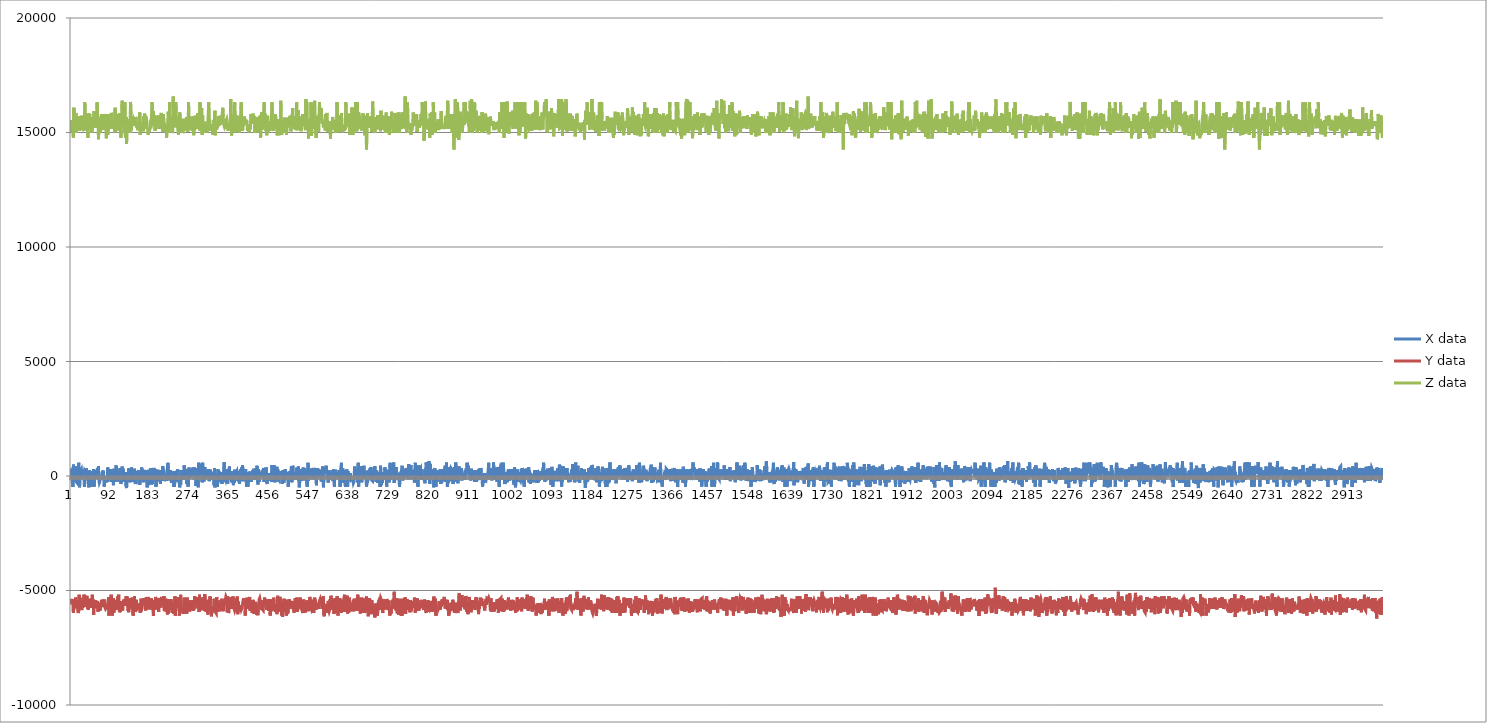
| Category | X data | Y data | Z data |
|---|---|---|---|
| 0 | 336 | -5360 | 15024 |
| 1 | 0 | -5600 | 15536 |
| 2 | -176 | -5392 | 15216 |
| 3 | -304 | -5552 | 15136 |
| 4 | -480 | -5392 | 15472 |
| 5 | 496 | -5968 | 14768 |
| 6 | 256 | -5744 | 16080 |
| 7 | -256 | -5680 | 15680 |
| 8 | -48 | -5648 | 15024 |
| 9 | -208 | -5776 | 15552 |
| 10 | 416 | -5312 | 15552 |
| 11 | 256 | -5360 | 15856 |
| 12 | -272 | -5360 | 14992 |
| 13 | -256 | -5632 | 15696 |
| 14 | -320 | -5568 | 15216 |
| 15 | -256 | -5600 | 15280 |
| 16 | -272 | -5984 | 15136 |
| 17 | 576 | -5904 | 15584 |
| 18 | -352 | -5184 | 15696 |
| 19 | -496 | -5488 | 15088 |
| 20 | -16 | -5312 | 15200 |
| 21 | 256 | -5808 | 15488 |
| 22 | 240 | -5488 | 15104 |
| 23 | 320 | -5504 | 15728 |
| 24 | 320 | -5856 | 15424 |
| 25 | -96 | -5488 | 15344 |
| 26 | 48 | -5760 | 15360 |
| 27 | 144 | -5392 | 15216 |
| 28 | 304 | -5648 | 15296 |
| 29 | -48 | -5184 | 15088 |
| 30 | -480 | -5312 | 15472 |
| 31 | 256 | -5360 | 16320 |
| 32 | 288 | -5600 | 15568 |
| 33 | 208 | -5712 | 15104 |
| 34 | 336 | -5648 | 15264 |
| 35 | 256 | -5280 | 15216 |
| 36 | 192 | -5232 | 15792 |
| 37 | -176 | -5808 | 15248 |
| 38 | -96 | -5584 | 14768 |
| 39 | -336 | -5840 | 15536 |
| 40 | -496 | -5696 | 15840 |
| 41 | 240 | -5440 | 15216 |
| 42 | 192 | -5360 | 15808 |
| 43 | -176 | -5392 | 15344 |
| 44 | 208 | -5648 | 15408 |
| 45 | -480 | -5456 | 15680 |
| 46 | 208 | -5760 | 15104 |
| 47 | -144 | -5360 | 14992 |
| 48 | -480 | -5184 | 15184 |
| 49 | -64 | -5440 | 15312 |
| 50 | -96 | -5392 | 15440 |
| 51 | 304 | -6064 | 15424 |
| 52 | -464 | -5472 | 15936 |
| 53 | -144 | -5584 | 15488 |
| 54 | 160 | -5728 | 15440 |
| 55 | 16 | -5776 | 15488 |
| 56 | -64 | -5440 | 15216 |
| 57 | 256 | -5440 | 15872 |
| 58 | 112 | -5712 | 15392 |
| 59 | 256 | -5664 | 16320 |
| 60 | 352 | -5472 | 15808 |
| 61 | -128 | -5920 | 15680 |
| 62 | 432 | -5712 | 14704 |
| 63 | -176 | -5696 | 15216 |
| 64 | -304 | -5552 | 15424 |
| 65 | -256 | -5712 | 15392 |
| 66 | -96 | -5872 | 14976 |
| 67 | -112 | -5728 | 15680 |
| 68 | 16 | -5520 | 15264 |
| 69 | -176 | -5408 | 15808 |
| 70 | -160 | -5632 | 15504 |
| 71 | 160 | -5408 | 15744 |
| 72 | 160 | -5584 | 15552 |
| 73 | 240 | -5648 | 15104 |
| 74 | -48 | -5712 | 15808 |
| 75 | -464 | -5440 | 15840 |
| 76 | -304 | -5392 | 15408 |
| 77 | -144 | -5760 | 15504 |
| 78 | -256 | -5808 | 15504 |
| 79 | -48 | -5792 | 15808 |
| 80 | -272 | -5824 | 14752 |
| 81 | -144 | -5712 | 15152 |
| 82 | -256 | -5728 | 15792 |
| 83 | 368 | -5584 | 14896 |
| 84 | 368 | -5808 | 15552 |
| 85 | -176 | -5296 | 15088 |
| 86 | -64 | -6096 | 15744 |
| 87 | 304 | -5824 | 15168 |
| 88 | -128 | -5488 | 15472 |
| 89 | 256 | -5712 | 15808 |
| 90 | 272 | -5280 | 15200 |
| 91 | -256 | -5184 | 15856 |
| 92 | 288 | -5376 | 15808 |
| 93 | -96 | -5888 | 15488 |
| 94 | 96 | -6096 | 15488 |
| 95 | -64 | -5616 | 15152 |
| 96 | -400 | -5344 | 15552 |
| 97 | 256 | -5968 | 15152 |
| 98 | 320 | -5456 | 15216 |
| 99 | -176 | -5808 | 15008 |
| 100 | -256 | -5424 | 16080 |
| 101 | -80 | -5568 | 15024 |
| 102 | 464 | -5840 | 15600 |
| 103 | 272 | -5440 | 15808 |
| 104 | 304 | -5792 | 15248 |
| 105 | -16 | -5392 | 15360 |
| 106 | -240 | -5248 | 15152 |
| 107 | -256 | -5360 | 15440 |
| 108 | -48 | -5184 | 15088 |
| 109 | 160 | -5840 | 15488 |
| 110 | -64 | -5952 | 15840 |
| 111 | 336 | -5888 | 15488 |
| 112 | 128 | -5936 | 15520 |
| 113 | -352 | -5472 | 14768 |
| 114 | -352 | -5872 | 15808 |
| 115 | 256 | -5552 | 15376 |
| 116 | 416 | -5824 | 16384 |
| 117 | 112 | -5872 | 15488 |
| 118 | 320 | -5504 | 15440 |
| 119 | -240 | -5440 | 15280 |
| 120 | 176 | -5472 | 15808 |
| 121 | -160 | -5424 | 14992 |
| 122 | 48 | -5424 | 16320 |
| 123 | -144 | -5664 | 14896 |
| 124 | 176 | -5536 | 14768 |
| 125 | -464 | -5248 | 15680 |
| 126 | -528 | -5536 | 14512 |
| 127 | 160 | -5264 | 15472 |
| 128 | -144 | -5600 | 15232 |
| 129 | -16 | -5888 | 15584 |
| 130 | -48 | -5840 | 15216 |
| 131 | 336 | -5952 | 15040 |
| 132 | 320 | -5536 | 15136 |
| 133 | -272 | -5712 | 15136 |
| 134 | -288 | -5568 | 14992 |
| 135 | -32 | -5328 | 16336 |
| 136 | -208 | -5776 | 15808 |
| 137 | 368 | -5584 | 15088 |
| 138 | 256 | -5408 | 15472 |
| 139 | -256 | -5312 | 15696 |
| 140 | 0 | -5312 | 15728 |
| 141 | 32 | -6096 | 15488 |
| 142 | -112 | -5344 | 15600 |
| 143 | -16 | -5424 | 15552 |
| 144 | 320 | -5248 | 15280 |
| 145 | -96 | -5920 | 15520 |
| 146 | -48 | -5904 | 15392 |
| 147 | -352 | -5824 | 15680 |
| 148 | -224 | -5408 | 15600 |
| 149 | -96 | -5648 | 15216 |
| 150 | 208 | -5808 | 15488 |
| 151 | -176 | -5840 | 15104 |
| 152 | 208 | -5760 | 15104 |
| 153 | 256 | -5760 | 15280 |
| 154 | -160 | -5616 | 15280 |
| 155 | 0 | -5776 | 15184 |
| 156 | -384 | -5568 | 15872 |
| 157 | -16 | -5968 | 14896 |
| 158 | 48 | -5696 | 15136 |
| 159 | -160 | -5360 | 15152 |
| 160 | 368 | -5904 | 15360 |
| 161 | 336 | -5472 | 15232 |
| 162 | 352 | -5584 | 15296 |
| 163 | 192 | -5520 | 15472 |
| 164 | -272 | -5360 | 15056 |
| 165 | 256 | -5584 | 15712 |
| 166 | 208 | -5328 | 15152 |
| 167 | 256 | -5344 | 15824 |
| 168 | 48 | -5696 | 15712 |
| 169 | 176 | -5872 | 15376 |
| 170 | 256 | -5584 | 15568 |
| 171 | -224 | -5296 | 15696 |
| 172 | 192 | -5840 | 15248 |
| 173 | -496 | -5488 | 15216 |
| 174 | 208 | -5808 | 15136 |
| 175 | -400 | -5280 | 14896 |
| 176 | -240 | -5440 | 15152 |
| 177 | 272 | -5584 | 15152 |
| 178 | -304 | -5728 | 15024 |
| 179 | -144 | -5376 | 15216 |
| 180 | -256 | -5824 | 15520 |
| 181 | 336 | -5728 | 15184 |
| 182 | 48 | -5344 | 15152 |
| 183 | -368 | -5440 | 15808 |
| 184 | 288 | -5744 | 16320 |
| 185 | -336 | -5776 | 15360 |
| 186 | 192 | -5840 | 15488 |
| 187 | 192 | -6112 | 15936 |
| 188 | 352 | -5648 | 15296 |
| 189 | 256 | -5584 | 15680 |
| 190 | -128 | -5408 | 15760 |
| 191 | -144 | -5824 | 15072 |
| 192 | 288 | -5280 | 15344 |
| 193 | -464 | -5440 | 15152 |
| 194 | -64 | -5712 | 15600 |
| 195 | -96 | -5808 | 15680 |
| 196 | 160 | -5328 | 15440 |
| 197 | 208 | -5440 | 15552 |
| 198 | 272 | -5808 | 15744 |
| 199 | 0 | -5936 | 15488 |
| 200 | 80 | -5328 | 15152 |
| 201 | -224 | -5424 | 15440 |
| 202 | 192 | -5760 | 15488 |
| 203 | -336 | -5472 | 15328 |
| 204 | 112 | -5520 | 15312 |
| 205 | -64 | -5600 | 15856 |
| 206 | 256 | -5280 | 15216 |
| 207 | -192 | -5600 | 15376 |
| 208 | 432 | -5616 | 15088 |
| 209 | 368 | -5440 | 15024 |
| 210 | 256 | -5728 | 15792 |
| 211 | -112 | -5248 | 15264 |
| 212 | -224 | -5872 | 15424 |
| 213 | -144 | -5744 | 15024 |
| 214 | -64 | -5904 | 15360 |
| 215 | -112 | -5360 | 15088 |
| 216 | 32 | -5888 | 15360 |
| 217 | -208 | -5424 | 14768 |
| 218 | 208 | -5904 | 15136 |
| 219 | 176 | -6048 | 15360 |
| 220 | 576 | -5760 | 15296 |
| 221 | 336 | -6000 | 15904 |
| 222 | -32 | -5376 | 14992 |
| 223 | -192 | -5360 | 15216 |
| 224 | -128 | -5840 | 16320 |
| 225 | 64 | -5632 | 15280 |
| 226 | 256 | -5632 | 15680 |
| 227 | 128 | -5376 | 15568 |
| 228 | -304 | -5568 | 15360 |
| 229 | -304 | -5920 | 15136 |
| 230 | -16 | -5968 | 14976 |
| 231 | -144 | -5936 | 15072 |
| 232 | -80 | -5520 | 16576 |
| 233 | -464 | -6000 | 15328 |
| 234 | 208 | -6000 | 15744 |
| 235 | -480 | -5584 | 15440 |
| 236 | 0 | -5248 | 15696 |
| 237 | 80 | -6096 | 15232 |
| 238 | 224 | -6096 | 16320 |
| 239 | -144 | -5392 | 15296 |
| 240 | 48 | -5600 | 15312 |
| 241 | -256 | -5296 | 15568 |
| 242 | 288 | -5312 | 15696 |
| 243 | 208 | -5760 | 15104 |
| 244 | -176 | -5584 | 14896 |
| 245 | -208 | -5664 | 15296 |
| 246 | -352 | -6096 | 15008 |
| 247 | -496 | -5856 | 15872 |
| 248 | -160 | -5728 | 15520 |
| 249 | -384 | -5184 | 15536 |
| 250 | 256 | -5600 | 15440 |
| 251 | 256 | -5584 | 15600 |
| 252 | -160 | -5904 | 15392 |
| 253 | 240 | -5952 | 15136 |
| 254 | -96 | -5792 | 14976 |
| 255 | -176 | -6016 | 15024 |
| 256 | 160 | -5760 | 15440 |
| 257 | 464 | -5312 | 15088 |
| 258 | 240 | -5456 | 15600 |
| 259 | 192 | -5440 | 15216 |
| 260 | 304 | -5536 | 15296 |
| 261 | 224 | -5392 | 15360 |
| 262 | 208 | -5776 | 15392 |
| 263 | -352 | -6016 | 15680 |
| 264 | 208 | -5312 | 15232 |
| 265 | 272 | -5792 | 15024 |
| 266 | -464 | -5808 | 15248 |
| 267 | -304 | -5440 | 16320 |
| 268 | 368 | -5792 | 15440 |
| 269 | -80 | -5920 | 15360 |
| 270 | 304 | -5712 | 15488 |
| 271 | -64 | -5504 | 15280 |
| 272 | 208 | -5760 | 15104 |
| 273 | 288 | -5792 | 15360 |
| 274 | 128 | -5424 | 15696 |
| 275 | 208 | -5648 | 15088 |
| 276 | 208 | -5824 | 15136 |
| 277 | 368 | -5888 | 15328 |
| 278 | -16 | -5488 | 15104 |
| 279 | 240 | -5840 | 14880 |
| 280 | 384 | -5712 | 15696 |
| 281 | -48 | -5248 | 15120 |
| 282 | -96 | -5664 | 15728 |
| 283 | 336 | -5584 | 15216 |
| 284 | -432 | -5648 | 15152 |
| 285 | -96 | -5504 | 15632 |
| 286 | 256 | -5648 | 15488 |
| 287 | -80 | -5312 | 15152 |
| 288 | -336 | -5776 | 15840 |
| 289 | -496 | -5312 | 15280 |
| 290 | 576 | -5808 | 15520 |
| 291 | -144 | -5936 | 15552 |
| 292 | 176 | -5184 | 15088 |
| 293 | -128 | -5872 | 16320 |
| 294 | -160 | -5600 | 15392 |
| 295 | 528 | -5440 | 15696 |
| 296 | -160 | -5648 | 15680 |
| 297 | 256 | -5312 | 16064 |
| 298 | -272 | -5376 | 14896 |
| 299 | 576 | -5856 | 15760 |
| 300 | 336 | -5360 | 15328 |
| 301 | -48 | -5392 | 15280 |
| 302 | -240 | -5776 | 15248 |
| 303 | 0 | -5888 | 15392 |
| 304 | 384 | -5152 | 15472 |
| 305 | 288 | -5728 | 15472 |
| 306 | 112 | -5920 | 14992 |
| 307 | -112 | -5696 | 15344 |
| 308 | 256 | -5584 | 15152 |
| 309 | -32 | -5456 | 15024 |
| 310 | 208 | -5904 | 15104 |
| 311 | 208 | -6048 | 15136 |
| 312 | 16 | -5424 | 15088 |
| 313 | 288 | -5760 | 16320 |
| 314 | -224 | -5376 | 15440 |
| 315 | 160 | -5840 | 15552 |
| 316 | -96 | -5264 | 15072 |
| 317 | 272 | -5824 | 15344 |
| 318 | 32 | -5792 | 15280 |
| 319 | 128 | -6128 | 15360 |
| 320 | -144 | -5920 | 15232 |
| 321 | -144 | -5696 | 15328 |
| 322 | 0 | -5792 | 14896 |
| 323 | 176 | -5952 | 15328 |
| 324 | 112 | -5712 | 15088 |
| 325 | -400 | -5360 | 15552 |
| 326 | 336 | -5504 | 14928 |
| 327 | -496 | -5456 | 15952 |
| 328 | -160 | -5936 | 14880 |
| 329 | -48 | -5968 | 15360 |
| 330 | -176 | -6000 | 15120 |
| 331 | -304 | -5280 | 15152 |
| 332 | 112 | -5936 | 15328 |
| 333 | -464 | -5568 | 15184 |
| 334 | 288 | -5440 | 15504 |
| 335 | 256 | -5696 | 15712 |
| 336 | -144 | -5504 | 15296 |
| 337 | 192 | -5872 | 15504 |
| 338 | -256 | -5664 | 15728 |
| 339 | -160 | -5904 | 15328 |
| 340 | -176 | -5696 | 15616 |
| 341 | 0 | -5408 | 15680 |
| 342 | 160 | -5728 | 15520 |
| 343 | -352 | -5360 | 15696 |
| 344 | 160 | -5664 | 15728 |
| 345 | -224 | -5728 | 16080 |
| 346 | -64 | -5904 | 15680 |
| 347 | 240 | -5584 | 15328 |
| 348 | 608 | -5520 | 15360 |
| 349 | -240 | -5376 | 15216 |
| 350 | -144 | -5648 | 15264 |
| 351 | -192 | -5376 | 15440 |
| 352 | -64 | -5264 | 15152 |
| 353 | -176 | -5312 | 15552 |
| 354 | 288 | -5296 | 15600 |
| 355 | -16 | -5952 | 15488 |
| 356 | -336 | -5264 | 15344 |
| 357 | -80 | -5664 | 15072 |
| 358 | 112 | -5984 | 15328 |
| 359 | -80 | -5920 | 15296 |
| 360 | 416 | -5312 | 15344 |
| 361 | -176 | -5632 | 15328 |
| 362 | 112 | -5392 | 15088 |
| 363 | -128 | -5808 | 16448 |
| 364 | 208 | -5312 | 15712 |
| 365 | -272 | -5568 | 14864 |
| 366 | -32 | -5296 | 15808 |
| 367 | -80 | -5792 | 15328 |
| 368 | -48 | -5264 | 15248 |
| 369 | -400 | -5680 | 15104 |
| 370 | 0 | -5504 | 15680 |
| 371 | -288 | -5824 | 15008 |
| 372 | 272 | -5888 | 16320 |
| 373 | -96 | -5824 | 15456 |
| 374 | -144 | -5696 | 15168 |
| 375 | 128 | -5328 | 15152 |
| 376 | 128 | -5888 | 15360 |
| 377 | 208 | -5728 | 15744 |
| 378 | 208 | -5264 | 15184 |
| 379 | -224 | -6032 | 15024 |
| 380 | 208 | -5488 | 15696 |
| 381 | -176 | -5936 | 15360 |
| 382 | -176 | -5776 | 14976 |
| 383 | -336 | -5792 | 15552 |
| 384 | -80 | -5728 | 15440 |
| 385 | 288 | -5648 | 15216 |
| 386 | -16 | -5744 | 15184 |
| 387 | -96 | -5840 | 16320 |
| 388 | 384 | -5792 | 15072 |
| 389 | 256 | -5648 | 15392 |
| 390 | 464 | -5584 | 15088 |
| 391 | -224 | -5632 | 15424 |
| 392 | 272 | -5328 | 15280 |
| 393 | -112 | -5616 | 15296 |
| 394 | -224 | -5440 | 15696 |
| 395 | 256 | -5600 | 15680 |
| 396 | 176 | -6096 | 15488 |
| 397 | 288 | -5552 | 15520 |
| 398 | -80 | -5728 | 15328 |
| 399 | -464 | -5504 | 15552 |
| 400 | -208 | -5312 | 15440 |
| 401 | -48 | -5648 | 15072 |
| 402 | -464 | -5808 | 15168 |
| 403 | -464 | -5472 | 15248 |
| 404 | 160 | -5456 | 15152 |
| 405 | 112 | -5760 | 15008 |
| 406 | 192 | -5280 | 15344 |
| 407 | -176 | -5872 | 15136 |
| 408 | 176 | -5568 | 15360 |
| 409 | -256 | -5568 | 15808 |
| 410 | 0 | -5872 | 15376 |
| 411 | -144 | -5424 | 15488 |
| 412 | 48 | -5984 | 15744 |
| 413 | 256 | -5664 | 15728 |
| 414 | 32 | -5408 | 15824 |
| 415 | -144 | -5600 | 15392 |
| 416 | 320 | -6016 | 15360 |
| 417 | 176 | -5728 | 15712 |
| 418 | -144 | -5600 | 14976 |
| 419 | 96 | -5488 | 15296 |
| 420 | -176 | -5904 | 15296 |
| 421 | 288 | -5856 | 15488 |
| 422 | 336 | -6064 | 15488 |
| 423 | 448 | -5584 | 15232 |
| 424 | -144 | -6032 | 15680 |
| 425 | -368 | -6080 | 15008 |
| 426 | 288 | -5632 | 15504 |
| 427 | 192 | -5680 | 15440 |
| 428 | -256 | -5376 | 15600 |
| 429 | 16 | -5328 | 15728 |
| 430 | 96 | -5424 | 15696 |
| 431 | -80 | -5440 | 14768 |
| 432 | 160 | -5664 | 15728 |
| 433 | -32 | -5840 | 15808 |
| 434 | 192 | -5440 | 15888 |
| 435 | 208 | -5824 | 15136 |
| 436 | 176 | -5808 | 15616 |
| 437 | 272 | -5872 | 15584 |
| 438 | 352 | -5440 | 15808 |
| 439 | -256 | -5680 | 16320 |
| 440 | 304 | -5312 | 15216 |
| 441 | 192 | -5296 | 15824 |
| 442 | 352 | -5472 | 15296 |
| 443 | -144 | -5584 | 15056 |
| 444 | 368 | -5408 | 15216 |
| 445 | -272 | -5840 | 14880 |
| 446 | -352 | -5568 | 15392 |
| 447 | 128 | -5424 | 15728 |
| 448 | 160 | -5760 | 15008 |
| 449 | -160 | -5888 | 15488 |
| 450 | 128 | -5376 | 15088 |
| 451 | -64 | -5616 | 15488 |
| 452 | -48 | -5616 | 15440 |
| 453 | -208 | -6096 | 15296 |
| 454 | -16 | -5392 | 15088 |
| 455 | -176 | -5728 | 15328 |
| 456 | -256 | -5744 | 15840 |
| 457 | 480 | -5904 | 16320 |
| 458 | 160 | -5696 | 15136 |
| 459 | -240 | -5824 | 15360 |
| 460 | 208 | -5648 | 15136 |
| 461 | 208 | -5312 | 15072 |
| 462 | 464 | -5744 | 15408 |
| 463 | -272 | -5584 | 15344 |
| 464 | 160 | -5824 | 15520 |
| 465 | -16 | -5936 | 15808 |
| 466 | -64 | -5728 | 15216 |
| 467 | 32 | -5872 | 15264 |
| 468 | 400 | -6032 | 15584 |
| 469 | -80 | -5904 | 14880 |
| 470 | 288 | -5232 | 15568 |
| 471 | -240 | -5920 | 15488 |
| 472 | -96 | -5776 | 15520 |
| 473 | -144 | -5696 | 14880 |
| 474 | -48 | -5808 | 15328 |
| 475 | 80 | -5280 | 15344 |
| 476 | 112 | -5504 | 15584 |
| 477 | 208 | -5472 | 16384 |
| 478 | -64 | -5632 | 15152 |
| 479 | 48 | -6096 | 14896 |
| 480 | -336 | -5904 | 15184 |
| 481 | -176 | -6144 | 15136 |
| 482 | 256 | -6032 | 15504 |
| 483 | -16 | -5536 | 15344 |
| 484 | -288 | -5360 | 14992 |
| 485 | -64 | -5504 | 15648 |
| 486 | -176 | -5408 | 15296 |
| 487 | 288 | -5936 | 15488 |
| 488 | 256 | -5408 | 15216 |
| 489 | -176 | -5968 | 15328 |
| 490 | 176 | -6096 | 14896 |
| 491 | 96 | -5840 | 15440 |
| 492 | -16 | -5584 | 15648 |
| 493 | 176 | -6000 | 15296 |
| 494 | -464 | -5440 | 15472 |
| 495 | 160 | -5632 | 15440 |
| 496 | -224 | -5376 | 15648 |
| 497 | 208 | -5664 | 15232 |
| 498 | 128 | -5632 | 15728 |
| 499 | -256 | -5488 | 15728 |
| 500 | 208 | -5808 | 15056 |
| 501 | 432 | -5728 | 15520 |
| 502 | -272 | -5696 | 15360 |
| 503 | -80 | -5504 | 15328 |
| 504 | 448 | -5456 | 16064 |
| 505 | 352 | -5632 | 15296 |
| 506 | -112 | -5712 | 15376 |
| 507 | -80 | -5968 | 15248 |
| 508 | 176 | -5600 | 15152 |
| 509 | 48 | -5776 | 15712 |
| 510 | 160 | -5344 | 15504 |
| 511 | -176 | -5920 | 15104 |
| 512 | -144 | -5488 | 15152 |
| 513 | 288 | -5552 | 16320 |
| 514 | 368 | -5312 | 15104 |
| 515 | 0 | -5936 | 15872 |
| 516 | 208 | -5632 | 15104 |
| 517 | 416 | -5584 | 15968 |
| 518 | -208 | -5440 | 15248 |
| 519 | -496 | -5552 | 15696 |
| 520 | -256 | -5792 | 15280 |
| 521 | -64 | -5312 | 15536 |
| 522 | 288 | -5648 | 15152 |
| 523 | -208 | -5584 | 15056 |
| 524 | -192 | -5504 | 15024 |
| 525 | 288 | -5856 | 15360 |
| 526 | -192 | -5872 | 15680 |
| 527 | 272 | -5984 | 15808 |
| 528 | 368 | -5792 | 15360 |
| 529 | 176 | -5392 | 15296 |
| 530 | 352 | -5744 | 15696 |
| 531 | -144 | -5648 | 15776 |
| 532 | -16 | -5968 | 15808 |
| 533 | 160 | -5744 | 15104 |
| 534 | -192 | -5584 | 16448 |
| 535 | -160 | -5680 | 15216 |
| 536 | 224 | -5440 | 16320 |
| 537 | -464 | -5872 | 15360 |
| 538 | 288 | -5680 | 15536 |
| 539 | 576 | -5904 | 15408 |
| 540 | -208 | -5760 | 14736 |
| 541 | 32 | -5744 | 15232 |
| 542 | 272 | -5792 | 15584 |
| 543 | -48 | -5280 | 15568 |
| 544 | 320 | -5408 | 15360 |
| 545 | 272 | -5696 | 15168 |
| 546 | -80 | -5808 | 16320 |
| 547 | -48 | -5856 | 14864 |
| 548 | 288 | -5824 | 15872 |
| 549 | -144 | -5744 | 15424 |
| 550 | 272 | -5408 | 15152 |
| 551 | 192 | -5504 | 15440 |
| 552 | 352 | -5984 | 15360 |
| 553 | 272 | -5376 | 16080 |
| 554 | -96 | -5312 | 16384 |
| 555 | 208 | -5488 | 15152 |
| 556 | -96 | -5408 | 15520 |
| 557 | 352 | -5840 | 14768 |
| 558 | -400 | -5584 | 14832 |
| 559 | 144 | -5632 | 15712 |
| 560 | 256 | -5776 | 15744 |
| 561 | 336 | -5808 | 15104 |
| 562 | -80 | -5600 | 15392 |
| 563 | -80 | -5792 | 15024 |
| 564 | 256 | -5760 | 15776 |
| 565 | 176 | -5440 | 16320 |
| 566 | 192 | -5472 | 15728 |
| 567 | 272 | -5344 | 15824 |
| 568 | -64 | -5408 | 15568 |
| 569 | -240 | -5456 | 16064 |
| 570 | -64 | -5280 | 16064 |
| 571 | -48 | -5808 | 15392 |
| 572 | 416 | -5792 | 15456 |
| 573 | -96 | -5584 | 15392 |
| 574 | -496 | -5248 | 15216 |
| 575 | 32 | -6064 | 15280 |
| 576 | 336 | -6128 | 15360 |
| 577 | 160 | -5664 | 15248 |
| 578 | 368 | -5584 | 15088 |
| 579 | 96 | -5600 | 15808 |
| 580 | 448 | -5856 | 15488 |
| 581 | 272 | -5984 | 15584 |
| 582 | 176 | -5648 | 15856 |
| 583 | 32 | -5856 | 15024 |
| 584 | -112 | -5712 | 15184 |
| 585 | -288 | -5456 | 15328 |
| 586 | 240 | -5840 | 15440 |
| 587 | 240 | -5920 | 15488 |
| 588 | 160 | -5856 | 15280 |
| 589 | -16 | -5392 | 15392 |
| 590 | 112 | -5840 | 14736 |
| 591 | 128 | -5232 | 15280 |
| 592 | -160 | -5312 | 15440 |
| 593 | -16 | -5728 | 15136 |
| 594 | 160 | -5824 | 15488 |
| 595 | 256 | -5440 | 15680 |
| 596 | -224 | -5824 | 15408 |
| 597 | 288 | -5392 | 15552 |
| 598 | 272 | -6016 | 15136 |
| 599 | -464 | -5632 | 15104 |
| 600 | 176 | -5968 | 15520 |
| 601 | 96 | -5328 | 14992 |
| 602 | 272 | -5824 | 15136 |
| 603 | 240 | -5648 | 15072 |
| 604 | -32 | -5424 | 14992 |
| 605 | 160 | -5248 | 16320 |
| 606 | -64 | -5360 | 15440 |
| 607 | 112 | -6096 | 15328 |
| 608 | 176 | -5536 | 15040 |
| 609 | -144 | -5920 | 15360 |
| 610 | -128 | -5344 | 15536 |
| 611 | 256 | -5824 | 15744 |
| 612 | -480 | -5360 | 15024 |
| 613 | 256 | -5856 | 15712 |
| 614 | 256 | -5584 | 15408 |
| 615 | 576 | -5968 | 15840 |
| 616 | -288 | -5728 | 15296 |
| 617 | -16 | -5696 | 15008 |
| 618 | 336 | -5696 | 15328 |
| 619 | -48 | -5920 | 15360 |
| 620 | -144 | -5408 | 15248 |
| 621 | -176 | -5280 | 15056 |
| 622 | -304 | -5184 | 15312 |
| 623 | -144 | -5568 | 15136 |
| 624 | -464 | -5232 | 15216 |
| 625 | 256 | -5936 | 16320 |
| 626 | -480 | -5504 | 15248 |
| 627 | 288 | -5808 | 15776 |
| 628 | 64 | -5232 | 15280 |
| 629 | -464 | -6000 | 15360 |
| 630 | 208 | -5360 | 15584 |
| 631 | -160 | -5968 | 15232 |
| 632 | -96 | -5904 | 15376 |
| 633 | -112 | -5312 | 15824 |
| 634 | -144 | -5808 | 14896 |
| 635 | 128 | -5744 | 15152 |
| 636 | -176 | -5648 | 15152 |
| 637 | -160 | -5904 | 15392 |
| 638 | -176 | -5680 | 15152 |
| 639 | -176 | -5680 | 16096 |
| 640 | -96 | -5728 | 15280 |
| 641 | -208 | -5488 | 14896 |
| 642 | -320 | -5440 | 15808 |
| 643 | -272 | -5904 | 15488 |
| 644 | 64 | -5360 | 14992 |
| 645 | 416 | -5824 | 15152 |
| 646 | -48 | -5760 | 15264 |
| 647 | 304 | -5584 | 16320 |
| 648 | 272 | -5712 | 15504 |
| 649 | 208 | -5440 | 15920 |
| 650 | 160 | -5360 | 15056 |
| 651 | -272 | -5888 | 16320 |
| 652 | -16 | -5184 | 15152 |
| 653 | 576 | -5552 | 15280 |
| 654 | -480 | -5312 | 15872 |
| 655 | -480 | -5424 | 15824 |
| 656 | 272 | -5856 | 15696 |
| 657 | 320 | -5536 | 15280 |
| 658 | 160 | -6000 | 15392 |
| 659 | -208 | -5632 | 15152 |
| 660 | 416 | -5984 | 15584 |
| 661 | -272 | -5312 | 15088 |
| 662 | 48 | -5888 | 15360 |
| 663 | 32 | -5376 | 15408 |
| 664 | -64 | -5344 | 15840 |
| 665 | 208 | -5392 | 15152 |
| 666 | 448 | -5568 | 15744 |
| 667 | -80 | -5360 | 15280 |
| 668 | 192 | -5984 | 14880 |
| 669 | 240 | -5808 | 15136 |
| 670 | -64 | -5648 | 15696 |
| 671 | -160 | -5360 | 14992 |
| 672 | -464 | -5264 | 14256 |
| 673 | -240 | -5920 | 15136 |
| 674 | -304 | -5584 | 15840 |
| 675 | -176 | -5632 | 15440 |
| 676 | 224 | -6128 | 15360 |
| 677 | -64 | -5664 | 15680 |
| 678 | 272 | -5328 | 15216 |
| 679 | 160 | -5504 | 15280 |
| 680 | 320 | -5392 | 15568 |
| 681 | 112 | -5792 | 15296 |
| 682 | 384 | -5664 | 15712 |
| 683 | -160 | -6032 | 15424 |
| 684 | -160 | -5424 | 15024 |
| 685 | -160 | -5904 | 15680 |
| 686 | -224 | -5616 | 16352 |
| 687 | -192 | -5648 | 15760 |
| 688 | 0 | -5840 | 15360 |
| 689 | 176 | -5936 | 15248 |
| 690 | 272 | -6064 | 15136 |
| 691 | 432 | -6176 | 14976 |
| 692 | -64 | -6016 | 15680 |
| 693 | 208 | -5568 | 15328 |
| 694 | -256 | -5792 | 15392 |
| 695 | 240 | -5696 | 15392 |
| 696 | -144 | -5856 | 15136 |
| 697 | -304 | -6096 | 15744 |
| 698 | -176 | -5664 | 15152 |
| 699 | -16 | -5488 | 15120 |
| 700 | 0 | -5440 | 15744 |
| 701 | 160 | -5520 | 15696 |
| 702 | 128 | -5840 | 15536 |
| 703 | -480 | -5424 | 15440 |
| 704 | 448 | -5312 | 15056 |
| 705 | -240 | -5360 | 15952 |
| 706 | -400 | -5824 | 15136 |
| 707 | 96 | -5376 | 15728 |
| 708 | -304 | -5584 | 15696 |
| 709 | 128 | -5984 | 15488 |
| 710 | -144 | -5456 | 15328 |
| 711 | 160 | -5824 | 15264 |
| 712 | -64 | -5376 | 15280 |
| 713 | 128 | -5776 | 15360 |
| 714 | 384 | -5392 | 15728 |
| 715 | -16 | -5360 | 14992 |
| 716 | -48 | -5472 | 15280 |
| 717 | -144 | -5824 | 15872 |
| 718 | -464 | -5376 | 14992 |
| 719 | 272 | -5424 | 15280 |
| 720 | -80 | -5840 | 15008 |
| 721 | -128 | -5792 | 15712 |
| 722 | 32 | -5824 | 15488 |
| 723 | -272 | -5440 | 15120 |
| 724 | -160 | -5872 | 14896 |
| 725 | 464 | -6096 | 15248 |
| 726 | 576 | -5984 | 15584 |
| 727 | -160 | -5840 | 15392 |
| 728 | 384 | -6000 | 15280 |
| 729 | 128 | -5728 | 15904 |
| 730 | 384 | -5792 | 15712 |
| 731 | 48 | -5408 | 15184 |
| 732 | 336 | -5808 | 15088 |
| 733 | 304 | -5840 | 15008 |
| 734 | 592 | -5392 | 15440 |
| 735 | -304 | -5056 | 15280 |
| 736 | 176 | -5456 | 15056 |
| 737 | -176 | -5376 | 15856 |
| 738 | 32 | -5424 | 15472 |
| 739 | 208 | -5872 | 14976 |
| 740 | 384 | -5344 | 15312 |
| 741 | -176 | -5568 | 15328 |
| 742 | -144 | -6000 | 15440 |
| 743 | -32 | -5424 | 15376 |
| 744 | -16 | -5376 | 15088 |
| 745 | 144 | -6064 | 15872 |
| 746 | -32 | -5920 | 15152 |
| 747 | -464 | -5360 | 14992 |
| 748 | -192 | -5792 | 15280 |
| 749 | 32 | -5712 | 15808 |
| 750 | 192 | -5728 | 15184 |
| 751 | 48 | -6096 | 15488 |
| 752 | 240 | -5584 | 15152 |
| 753 | 448 | -6096 | 15872 |
| 754 | -128 | -5360 | 15440 |
| 755 | -192 | -5440 | 15472 |
| 756 | 208 | -5648 | 15280 |
| 757 | -96 | -5584 | 15472 |
| 758 | -64 | -5872 | 15744 |
| 759 | 160 | -5584 | 15216 |
| 760 | 320 | -5296 | 16576 |
| 761 | -48 | -6016 | 15168 |
| 762 | 272 | -5664 | 15584 |
| 763 | 160 | -5776 | 15360 |
| 764 | 352 | -5376 | 14992 |
| 765 | 288 | -5488 | 16320 |
| 766 | 32 | -5856 | 15840 |
| 767 | -144 | -5680 | 15344 |
| 768 | 512 | -5504 | 15280 |
| 769 | 80 | -5584 | 15280 |
| 770 | 208 | -5424 | 15184 |
| 771 | 160 | -5952 | 15392 |
| 772 | 336 | -5424 | 15328 |
| 773 | 480 | -5648 | 14896 |
| 774 | -128 | -5632 | 15376 |
| 775 | 208 | -5728 | 15104 |
| 776 | 176 | -5552 | 15184 |
| 777 | 240 | -5472 | 15296 |
| 778 | 0 | -5584 | 15872 |
| 779 | 256 | -5744 | 15792 |
| 780 | -48 | -5536 | 15408 |
| 781 | -288 | -5312 | 15440 |
| 782 | 288 | -5744 | 15488 |
| 783 | 576 | -5968 | 15744 |
| 784 | 320 | -5584 | 15280 |
| 785 | 176 | -5584 | 15312 |
| 786 | 208 | -5344 | 15808 |
| 787 | -96 | -5568 | 15024 |
| 788 | -32 | -5360 | 15120 |
| 789 | -464 | -5648 | 15536 |
| 790 | 464 | -5824 | 15488 |
| 791 | -96 | -5888 | 15280 |
| 792 | 288 | -5712 | 15200 |
| 793 | 288 | -5792 | 15440 |
| 794 | 256 | -5792 | 15488 |
| 795 | 368 | -5584 | 15552 |
| 796 | -176 | -5408 | 15808 |
| 797 | 208 | -5712 | 15840 |
| 798 | 304 | -5488 | 15280 |
| 799 | 128 | -5744 | 16320 |
| 800 | -160 | -5504 | 15424 |
| 801 | -112 | -5616 | 15280 |
| 802 | -176 | -5856 | 15360 |
| 803 | -16 | -5568 | 14640 |
| 804 | -64 | -5392 | 15184 |
| 805 | -320 | -5568 | 15280 |
| 806 | 320 | -5744 | 16352 |
| 807 | 32 | -5920 | 15488 |
| 808 | 592 | -5984 | 15584 |
| 809 | 176 | -5584 | 15344 |
| 810 | -144 | -5552 | 15296 |
| 811 | 208 | -5760 | 15136 |
| 812 | 416 | -5424 | 15520 |
| 813 | -64 | -5824 | 15360 |
| 814 | 640 | -5616 | 15600 |
| 815 | 368 | -5920 | 15360 |
| 816 | -336 | -5952 | 14768 |
| 817 | 528 | -5456 | 15824 |
| 818 | 256 | -5824 | 15520 |
| 819 | 80 | -5808 | 15424 |
| 820 | -176 | -5776 | 15872 |
| 821 | -176 | -5584 | 14896 |
| 822 | 288 | -5920 | 15104 |
| 823 | 112 | -5600 | 15360 |
| 824 | -352 | -5632 | 16320 |
| 825 | -496 | -5264 | 15216 |
| 826 | 256 | -5344 | 15760 |
| 827 | 256 | -5712 | 15872 |
| 828 | 336 | -5808 | 15360 |
| 829 | -160 | -5360 | 14992 |
| 830 | -464 | -6096 | 15296 |
| 831 | 208 | -5760 | 15136 |
| 832 | 160 | -5904 | 15488 |
| 833 | 240 | -5744 | 15504 |
| 834 | 80 | -5712 | 15248 |
| 835 | -160 | -5840 | 15104 |
| 836 | -240 | -5792 | 15584 |
| 837 | -48 | -5472 | 15184 |
| 838 | -144 | -5648 | 15136 |
| 839 | -176 | -5760 | 15392 |
| 840 | 288 | -5840 | 15488 |
| 841 | -336 | -5504 | 15296 |
| 842 | -240 | -5472 | 15936 |
| 843 | -288 | -5696 | 15440 |
| 844 | 48 | -5392 | 15152 |
| 845 | 304 | -5552 | 15328 |
| 846 | 160 | -5616 | 15168 |
| 847 | -224 | -5408 | 15216 |
| 848 | -16 | -5488 | 15296 |
| 849 | 272 | -5280 | 15152 |
| 850 | 256 | -5568 | 15296 |
| 851 | 448 | -5792 | 15472 |
| 852 | -256 | -5664 | 15728 |
| 853 | 160 | -5504 | 15712 |
| 854 | 592 | -5616 | 15168 |
| 855 | -96 | -5584 | 15472 |
| 856 | -480 | -5408 | 15440 |
| 857 | -256 | -5856 | 16384 |
| 858 | -304 | -5584 | 15552 |
| 859 | 32 | -6096 | 15536 |
| 860 | -176 | -6128 | 15168 |
| 861 | 384 | -5760 | 15680 |
| 862 | -224 | -5888 | 15360 |
| 863 | 256 | -5840 | 15392 |
| 864 | 352 | -5536 | 15808 |
| 865 | 352 | -5872 | 15360 |
| 866 | 288 | -5648 | 15728 |
| 867 | -160 | -5824 | 14992 |
| 868 | 80 | -5408 | 15808 |
| 869 | -352 | -5408 | 15328 |
| 870 | -80 | -5520 | 14880 |
| 871 | 176 | -5648 | 14256 |
| 872 | 384 | -5984 | 15424 |
| 873 | -240 | -5968 | 15744 |
| 874 | 288 | -5568 | 16448 |
| 875 | 592 | -5728 | 14976 |
| 876 | 384 | -5536 | 15392 |
| 877 | -80 | -5824 | 14768 |
| 878 | 96 | -5712 | 15392 |
| 879 | 0 | -5936 | 16320 |
| 880 | -320 | -5984 | 15696 |
| 881 | 320 | -5744 | 15744 |
| 882 | 336 | -5280 | 14672 |
| 883 | 416 | -5120 | 15440 |
| 884 | 112 | -5776 | 15392 |
| 885 | 208 | -5872 | 15488 |
| 886 | 160 | -5792 | 15904 |
| 887 | -32 | -5376 | 14992 |
| 888 | 336 | -5376 | 15312 |
| 889 | -192 | -5200 | 15760 |
| 890 | -16 | -5312 | 14992 |
| 891 | 48 | -5664 | 15296 |
| 892 | 32 | -5616 | 15360 |
| 893 | -96 | -5728 | 15728 |
| 894 | 128 | -5344 | 16320 |
| 895 | -16 | -5504 | 15328 |
| 896 | -160 | -5824 | 15296 |
| 897 | 256 | -5856 | 16320 |
| 898 | 48 | -5248 | 15696 |
| 899 | 336 | -5312 | 15920 |
| 900 | 160 | -5936 | 15424 |
| 901 | 576 | -5792 | 15488 |
| 902 | 256 | -5584 | 15472 |
| 903 | 112 | -6032 | 15872 |
| 904 | 448 | -5632 | 15280 |
| 905 | 192 | -5808 | 15488 |
| 906 | -32 | -5280 | 14992 |
| 907 | 128 | -5776 | 15680 |
| 908 | 160 | -5552 | 16384 |
| 909 | -192 | -5648 | 15472 |
| 910 | -96 | -5952 | 15392 |
| 911 | 320 | -5792 | 16448 |
| 912 | -96 | -5504 | 16320 |
| 913 | -160 | -5424 | 14992 |
| 914 | -128 | -5648 | 15728 |
| 915 | -144 | -5488 | 15088 |
| 916 | 112 | -5520 | 15136 |
| 917 | 208 | -5760 | 15104 |
| 918 | -256 | -5584 | 16320 |
| 919 | 256 | -5840 | 15216 |
| 920 | -176 | -5824 | 15328 |
| 921 | 256 | -5296 | 15856 |
| 922 | -240 | -5296 | 15952 |
| 923 | -176 | -5424 | 15152 |
| 924 | -32 | -5456 | 14992 |
| 925 | -176 | -5584 | 15344 |
| 926 | -48 | -5792 | 15488 |
| 927 | 288 | -6032 | 15456 |
| 928 | -96 | -5584 | 15728 |
| 929 | 32 | -5792 | 15488 |
| 930 | 336 | -5456 | 15568 |
| 931 | -176 | -5312 | 15152 |
| 932 | 352 | -5584 | 15088 |
| 933 | 160 | -5664 | 15712 |
| 934 | -32 | -5360 | 14992 |
| 935 | -96 | -5424 | 15888 |
| 936 | -480 | -5648 | 15600 |
| 937 | -272 | -5504 | 15024 |
| 938 | 32 | -5536 | 15440 |
| 939 | 128 | -5648 | 15696 |
| 940 | -288 | -5664 | 15424 |
| 941 | 112 | -5872 | 15296 |
| 942 | -128 | -5568 | 15488 |
| 943 | -160 | -5392 | 15824 |
| 944 | -176 | -5536 | 15088 |
| 945 | -16 | -5616 | 15536 |
| 946 | -112 | -5328 | 15376 |
| 947 | -32 | -5360 | 14992 |
| 948 | -64 | -5312 | 15216 |
| 949 | 256 | -5360 | 15680 |
| 950 | 576 | -5312 | 14928 |
| 951 | -144 | -5280 | 15088 |
| 952 | -64 | -5440 | 15440 |
| 953 | 0 | -5648 | 15552 |
| 954 | 96 | -5888 | 15696 |
| 955 | 320 | -5328 | 15472 |
| 956 | 272 | -5920 | 15424 |
| 957 | -192 | -5632 | 15360 |
| 958 | 320 | -5584 | 15280 |
| 959 | 0 | -5824 | 15424 |
| 960 | -160 | -5920 | 15328 |
| 961 | 592 | -5760 | 15488 |
| 962 | 208 | -5504 | 15104 |
| 963 | 368 | -5904 | 15360 |
| 964 | 208 | -5760 | 15136 |
| 965 | -176 | -5584 | 15168 |
| 966 | -144 | -5792 | 15136 |
| 967 | 352 | -5728 | 15440 |
| 968 | 176 | -5808 | 15360 |
| 969 | -256 | -5392 | 15280 |
| 970 | 368 | -5488 | 15152 |
| 971 | -16 | -5680 | 15360 |
| 972 | 160 | -5968 | 15504 |
| 973 | -48 | -5696 | 15424 |
| 974 | -480 | -5360 | 14992 |
| 975 | 176 | -5824 | 15872 |
| 976 | 368 | -5376 | 15392 |
| 977 | 352 | -5392 | 15472 |
| 978 | 336 | -5328 | 15152 |
| 979 | 576 | -5904 | 15360 |
| 980 | 448 | -5648 | 16320 |
| 981 | -32 | -5360 | 15488 |
| 982 | -160 | -5440 | 15392 |
| 983 | 576 | -5936 | 15584 |
| 984 | 352 | -5744 | 15248 |
| 985 | -128 | -5904 | 14768 |
| 986 | -80 | -5424 | 16320 |
| 987 | -352 | -5504 | 15504 |
| 988 | -144 | -5584 | 15568 |
| 989 | -144 | -5664 | 15008 |
| 990 | 176 | -5792 | 15584 |
| 991 | -48 | -5648 | 15840 |
| 992 | -96 | -5824 | 16352 |
| 993 | -272 | -5488 | 15136 |
| 994 | 208 | -5632 | 15104 |
| 995 | 288 | -5312 | 15280 |
| 996 | -80 | -5488 | 14960 |
| 997 | 32 | -5728 | 15696 |
| 998 | -192 | -5584 | 15888 |
| 999 | -48 | -5440 | 15280 |
| 1000 | -176 | -5872 | 15264 |
| 1001 | 304 | -5424 | 15504 |
| 1002 | -144 | -5776 | 15296 |
| 1003 | 96 | -5664 | 15392 |
| 1004 | 288 | -5408 | 15952 |
| 1005 | 176 | -5856 | 15168 |
| 1006 | -16 | -5520 | 15232 |
| 1007 | -368 | -5440 | 15376 |
| 1008 | 224 | -5824 | 15696 |
| 1009 | 384 | -5536 | 15728 |
| 1010 | -256 | -5600 | 16320 |
| 1011 | -496 | -5968 | 15424 |
| 1012 | -240 | -5536 | 15248 |
| 1013 | -80 | -5904 | 15168 |
| 1014 | -192 | -5776 | 15280 |
| 1015 | -32 | -5296 | 16320 |
| 1016 | 288 | -5664 | 15248 |
| 1017 | -256 | -5392 | 15824 |
| 1018 | 160 | -5808 | 16320 |
| 1019 | 80 | -5840 | 14880 |
| 1020 | -160 | -5808 | 15360 |
| 1021 | -128 | -5744 | 15008 |
| 1022 | -224 | -5440 | 15248 |
| 1023 | -208 | -5712 | 15440 |
| 1024 | -256 | -5376 | 16336 |
| 1025 | 320 | -5904 | 15488 |
| 1026 | -256 | -5312 | 15248 |
| 1027 | 352 | -5424 | 15824 |
| 1028 | 320 | -5408 | 15808 |
| 1029 | -320 | -5776 | 15600 |
| 1030 | 288 | -5648 | 15280 |
| 1031 | -464 | -5424 | 15504 |
| 1032 | 112 | -5648 | 16320 |
| 1033 | 176 | -5376 | 15536 |
| 1034 | 240 | -5792 | 14736 |
| 1035 | 320 | -5584 | 15312 |
| 1036 | 144 | -5312 | 15824 |
| 1037 | -16 | -5600 | 15200 |
| 1038 | 176 | -5184 | 15152 |
| 1039 | 208 | -5760 | 15104 |
| 1040 | 288 | -5888 | 15360 |
| 1041 | 384 | -5312 | 15808 |
| 1042 | -272 | -5472 | 15120 |
| 1043 | 240 | -5776 | 15136 |
| 1044 | 208 | -5728 | 15168 |
| 1045 | -336 | -5744 | 15328 |
| 1046 | 112 | -5248 | 15088 |
| 1047 | -96 | -5648 | 15728 |
| 1048 | -192 | -5472 | 15088 |
| 1049 | -48 | -5920 | 15264 |
| 1050 | 64 | -5472 | 15824 |
| 1051 | -272 | -5312 | 15312 |
| 1052 | 16 | -5824 | 15136 |
| 1053 | -176 | -5664 | 15152 |
| 1054 | -176 | -5824 | 15872 |
| 1055 | 256 | -5856 | 15392 |
| 1056 | -48 | -5632 | 15136 |
| 1057 | 256 | -5808 | 16384 |
| 1058 | -208 | -6096 | 15808 |
| 1059 | -160 | -5808 | 15168 |
| 1060 | -304 | -5568 | 16320 |
| 1061 | 256 | -5568 | 15216 |
| 1062 | 208 | -5728 | 15136 |
| 1063 | -272 | -5616 | 15712 |
| 1064 | -144 | -5792 | 15712 |
| 1065 | -208 | -5856 | 15360 |
| 1066 | -48 | -5968 | 15424 |
| 1067 | 192 | -5552 | 15104 |
| 1068 | 0 | -5600 | 15488 |
| 1069 | 80 | -6032 | 15360 |
| 1070 | 192 | -5760 | 15520 |
| 1071 | -64 | -5744 | 15872 |
| 1072 | 208 | -5968 | 15808 |
| 1073 | 272 | -5824 | 15136 |
| 1074 | 192 | -5584 | 15216 |
| 1075 | 576 | -5584 | 15808 |
| 1076 | 0 | -5792 | 15696 |
| 1077 | -96 | -5360 | 16320 |
| 1078 | -256 | -5760 | 15680 |
| 1079 | 208 | -5840 | 15680 |
| 1080 | -48 | -5504 | 15680 |
| 1081 | 256 | -5472 | 16448 |
| 1082 | -176 | -5616 | 15696 |
| 1083 | -16 | -5728 | 15008 |
| 1084 | 320 | -5664 | 15728 |
| 1085 | -128 | -5648 | 15472 |
| 1086 | -176 | -5472 | 15376 |
| 1087 | 256 | -6096 | 15904 |
| 1088 | 0 | -5392 | 15552 |
| 1089 | 352 | -5552 | 15136 |
| 1090 | -176 | -5584 | 15280 |
| 1091 | -96 | -5840 | 15808 |
| 1092 | -384 | -5488 | 15584 |
| 1093 | 192 | -5904 | 16064 |
| 1094 | 400 | -5824 | 15584 |
| 1095 | 128 | -5280 | 15184 |
| 1096 | -480 | -5392 | 15440 |
| 1097 | -176 | -5728 | 15136 |
| 1098 | -80 | -5632 | 14832 |
| 1099 | 160 | -5904 | 15424 |
| 1100 | 224 | -5360 | 15840 |
| 1101 | -192 | -5680 | 15488 |
| 1102 | 48 | -5632 | 15392 |
| 1103 | 160 | -5872 | 15296 |
| 1104 | -224 | -5536 | 15536 |
| 1105 | 64 | -5696 | 15408 |
| 1106 | -48 | -5568 | 15216 |
| 1107 | 336 | -5344 | 15808 |
| 1108 | -176 | -5456 | 15216 |
| 1109 | -224 | -5456 | 16448 |
| 1110 | 272 | -5984 | 15584 |
| 1111 | 496 | -6016 | 15168 |
| 1112 | 208 | -5584 | 15136 |
| 1113 | 448 | -5696 | 15152 |
| 1114 | 160 | -5456 | 15216 |
| 1115 | 144 | -5616 | 15872 |
| 1116 | -464 | -5328 | 16464 |
| 1117 | 192 | -5648 | 15728 |
| 1118 | -256 | -5920 | 14864 |
| 1119 | 416 | -6096 | 16320 |
| 1120 | 448 | -5712 | 15840 |
| 1121 | 256 | -5808 | 15488 |
| 1122 | 256 | -5568 | 15408 |
| 1123 | -144 | -5552 | 15520 |
| 1124 | 192 | -5824 | 15136 |
| 1125 | -128 | -6016 | 15520 |
| 1126 | 288 | -5456 | 16448 |
| 1127 | -32 | -5296 | 16064 |
| 1128 | 352 | -5872 | 15040 |
| 1129 | -128 | -5840 | 15424 |
| 1130 | 144 | -5424 | 15824 |
| 1131 | -96 | -5392 | 15856 |
| 1132 | -272 | -5360 | 15088 |
| 1133 | -272 | -5504 | 15104 |
| 1134 | 48 | -5280 | 15568 |
| 1135 | -96 | -5664 | 15728 |
| 1136 | -240 | -5184 | 15824 |
| 1137 | -144 | -5792 | 15312 |
| 1138 | -144 | -5792 | 15072 |
| 1139 | 288 | -5856 | 15456 |
| 1140 | -96 | -5600 | 15728 |
| 1141 | 512 | -5840 | 15488 |
| 1142 | -16 | -5728 | 15088 |
| 1143 | 384 | -5856 | 15584 |
| 1144 | 16 | -5728 | 15296 |
| 1145 | 448 | -5648 | 15280 |
| 1146 | -272 | -5616 | 15424 |
| 1147 | -16 | -5696 | 14832 |
| 1148 | 592 | -5328 | 15088 |
| 1149 | -96 | -5424 | 15440 |
| 1150 | -96 | -5376 | 15712 |
| 1151 | 192 | -5056 | 15824 |
| 1152 | 256 | -5584 | 15280 |
| 1153 | 448 | -5840 | 15280 |
| 1154 | -112 | -5664 | 15216 |
| 1155 | -240 | -5440 | 15280 |
| 1156 | 112 | -5360 | 15344 |
| 1157 | -288 | -5776 | 15424 |
| 1158 | 208 | -5744 | 15280 |
| 1159 | 80 | -5824 | 15008 |
| 1160 | 192 | -6096 | 15232 |
| 1161 | 336 | -5344 | 15088 |
| 1162 | 224 | -5632 | 15248 |
| 1163 | 192 | -5376 | 15280 |
| 1164 | -32 | -5824 | 15232 |
| 1165 | 256 | -5920 | 15440 |
| 1166 | -160 | -5408 | 15424 |
| 1167 | 96 | -5232 | 15232 |
| 1168 | 288 | -5536 | 14688 |
| 1169 | 288 | -5568 | 15552 |
| 1170 | -512 | -5504 | 15504 |
| 1171 | -256 | -5376 | 15952 |
| 1172 | 160 | -5808 | 15328 |
| 1173 | -160 | -5392 | 15568 |
| 1174 | -160 | -5824 | 16320 |
| 1175 | -256 | -5824 | 15744 |
| 1176 | -48 | -5664 | 15808 |
| 1177 | -176 | -5296 | 15680 |
| 1178 | 352 | -5312 | 15328 |
| 1179 | 176 | -5824 | 15488 |
| 1180 | -32 | -5488 | 15120 |
| 1181 | 256 | -5664 | 15872 |
| 1182 | 400 | -5440 | 15392 |
| 1183 | 240 | -5472 | 15280 |
| 1184 | -96 | -5648 | 15168 |
| 1185 | 480 | -5904 | 16448 |
| 1186 | 416 | -5936 | 15488 |
| 1187 | 256 | -6016 | 15504 |
| 1188 | 128 | -6000 | 15744 |
| 1189 | -160 | -5856 | 15872 |
| 1190 | 208 | -5696 | 15104 |
| 1191 | 0 | -5776 | 15280 |
| 1192 | -192 | -5584 | 15440 |
| 1193 | -144 | -5856 | 15392 |
| 1194 | 352 | -5824 | 15024 |
| 1195 | -64 | -6112 | 15264 |
| 1196 | -272 | -5920 | 15296 |
| 1197 | 16 | -5584 | 15744 |
| 1198 | -48 | -5360 | 15344 |
| 1199 | 416 | -5792 | 15552 |
| 1200 | 0 | -5824 | 15616 |
| 1201 | -64 | -5824 | 14848 |
| 1202 | -464 | -5392 | 16320 |
| 1203 | -144 | -5376 | 15552 |
| 1204 | -176 | -5744 | 15088 |
| 1205 | 176 | -5632 | 15360 |
| 1206 | 128 | -5824 | 15872 |
| 1207 | -224 | -5184 | 16336 |
| 1208 | 272 | -5792 | 15584 |
| 1209 | 400 | -5488 | 15088 |
| 1210 | -48 | -5312 | 15184 |
| 1211 | 240 | -5680 | 15136 |
| 1212 | 336 | -5904 | 15488 |
| 1213 | 304 | -5200 | 15088 |
| 1214 | 80 | -5184 | 15184 |
| 1215 | -304 | -5584 | 15440 |
| 1216 | -352 | -5808 | 15488 |
| 1217 | -480 | -5312 | 15184 |
| 1218 | -128 | -5792 | 15360 |
| 1219 | -464 | -5408 | 15392 |
| 1220 | 352 | -5456 | 15712 |
| 1221 | -336 | -5840 | 15520 |
| 1222 | 160 | -5840 | 15072 |
| 1223 | 352 | -5296 | 14992 |
| 1224 | -80 | -5696 | 15296 |
| 1225 | -272 | -5760 | 14992 |
| 1226 | 592 | -5600 | 15296 |
| 1227 | 160 | -5344 | 15280 |
| 1228 | -64 | -5888 | 15648 |
| 1229 | -80 | -5456 | 15152 |
| 1230 | -160 | -5360 | 14992 |
| 1231 | -192 | -5968 | 15248 |
| 1232 | 176 | -5760 | 15360 |
| 1233 | 128 | -5504 | 15360 |
| 1234 | 304 | -5424 | 14768 |
| 1235 | 320 | -5760 | 15648 |
| 1236 | -176 | -5616 | 14896 |
| 1237 | -32 | -5808 | 15328 |
| 1238 | 256 | -5696 | 15904 |
| 1239 | 16 | -5984 | 15360 |
| 1240 | -320 | -5424 | 15728 |
| 1241 | 160 | -5792 | 15840 |
| 1242 | 304 | -5280 | 15552 |
| 1243 | -16 | -5648 | 15360 |
| 1244 | -64 | -5248 | 15872 |
| 1245 | 368 | -5968 | 15360 |
| 1246 | -16 | -5504 | 15104 |
| 1247 | 384 | -5408 | 15600 |
| 1248 | 368 | -5440 | 15056 |
| 1249 | 464 | -6096 | 15088 |
| 1250 | 112 | -5984 | 15136 |
| 1251 | 128 | -5696 | 15728 |
| 1252 | -16 | -5584 | 15216 |
| 1253 | -80 | -5664 | 15392 |
| 1254 | -128 | -5840 | 15872 |
| 1255 | 128 | -5568 | 15872 |
| 1256 | 288 | -5840 | 15360 |
| 1257 | -144 | -5968 | 14880 |
| 1258 | 208 | -5312 | 15280 |
| 1259 | -48 | -5792 | 15072 |
| 1260 | 352 | -5952 | 15456 |
| 1261 | 192 | -5824 | 15488 |
| 1262 | 176 | -5424 | 15216 |
| 1263 | -160 | -5344 | 15504 |
| 1264 | 272 | -5664 | 15392 |
| 1265 | 64 | -5632 | 15488 |
| 1266 | -256 | -5584 | 16064 |
| 1267 | 32 | -5664 | 15728 |
| 1268 | 256 | -5344 | 15088 |
| 1269 | 464 | -5584 | 14896 |
| 1270 | -96 | -5472 | 15184 |
| 1271 | 208 | -5760 | 15104 |
| 1272 | -160 | -5616 | 15312 |
| 1273 | -80 | -5328 | 15696 |
| 1274 | 176 | -5296 | 15472 |
| 1275 | -64 | -6096 | 15024 |
| 1276 | 176 | -5808 | 15584 |
| 1277 | -224 | -5600 | 16096 |
| 1278 | 128 | -5584 | 15696 |
| 1279 | 288 | -5584 | 15904 |
| 1280 | 160 | -5856 | 15744 |
| 1281 | -48 | -5968 | 15136 |
| 1282 | -176 | -5408 | 14896 |
| 1283 | 208 | -5600 | 15152 |
| 1284 | 128 | -5456 | 15680 |
| 1285 | 208 | -5248 | 15216 |
| 1286 | 128 | -5664 | 15728 |
| 1287 | 480 | -5904 | 15008 |
| 1288 | -48 | -5888 | 14880 |
| 1289 | -144 | -5952 | 15248 |
| 1290 | -16 | -5504 | 15104 |
| 1291 | 272 | -5984 | 15808 |
| 1292 | -288 | -5344 | 15728 |
| 1293 | 576 | -5792 | 15584 |
| 1294 | 384 | -5424 | 15296 |
| 1295 | -80 | -5840 | 14832 |
| 1296 | -224 | -5376 | 15600 |
| 1297 | -144 | -5504 | 14880 |
| 1298 | -272 | -5392 | 15280 |
| 1299 | -48 | -5600 | 15344 |
| 1300 | -80 | -5568 | 15296 |
| 1301 | 320 | -5568 | 15568 |
| 1302 | 448 | -5568 | 15808 |
| 1303 | 384 | -5408 | 15280 |
| 1304 | 288 | -5968 | 15488 |
| 1305 | -160 | -5632 | 16320 |
| 1306 | -96 | -5824 | 15296 |
| 1307 | -48 | -5216 | 15216 |
| 1308 | 272 | -5776 | 15264 |
| 1309 | 48 | -5648 | 15360 |
| 1310 | -224 | -5424 | 15696 |
| 1311 | -256 | -5712 | 16080 |
| 1312 | -64 | -5840 | 15392 |
| 1313 | 48 | -5584 | 14832 |
| 1314 | -80 | -6032 | 14896 |
| 1315 | 160 | -5744 | 15808 |
| 1316 | -64 | -5776 | 15552 |
| 1317 | 208 | -5456 | 15504 |
| 1318 | 336 | -5440 | 15152 |
| 1319 | 384 | -5664 | 15728 |
| 1320 | 496 | -5968 | 15360 |
| 1321 | -304 | -5952 | 15232 |
| 1322 | 384 | -5648 | 15728 |
| 1323 | -176 | -6096 | 15776 |
| 1324 | -32 | -5456 | 15024 |
| 1325 | -256 | -5760 | 15840 |
| 1326 | 80 | -5952 | 14976 |
| 1327 | 80 | -5840 | 15744 |
| 1328 | 368 | -5568 | 16064 |
| 1329 | 288 | -5648 | 15152 |
| 1330 | -176 | -5376 | 15152 |
| 1331 | 160 | -5440 | 15328 |
| 1332 | 192 | -5472 | 16064 |
| 1333 | -32 | -5344 | 14992 |
| 1334 | -192 | -6000 | 15840 |
| 1335 | -176 | -5456 | 15216 |
| 1336 | -144 | -5712 | 15328 |
| 1337 | 272 | -5904 | 15136 |
| 1338 | 272 | -5984 | 15584 |
| 1339 | -272 | -5904 | 15808 |
| 1340 | 0 | -5520 | 15504 |
| 1341 | 576 | -5984 | 15584 |
| 1342 | -240 | -5184 | 15216 |
| 1343 | -160 | -5360 | 14992 |
| 1344 | -320 | -5616 | 15504 |
| 1345 | -464 | -6000 | 15360 |
| 1346 | -128 | -5616 | 15728 |
| 1347 | -16 | -5760 | 14880 |
| 1348 | -80 | -5376 | 15824 |
| 1349 | -160 | -5440 | 14832 |
| 1350 | 160 | -5792 | 15712 |
| 1351 | -144 | -5712 | 15184 |
| 1352 | 256 | -5776 | 15504 |
| 1353 | -176 | -5440 | 15728 |
| 1354 | 320 | -5280 | 14992 |
| 1355 | 288 | -5856 | 15360 |
| 1356 | 272 | -5344 | 15216 |
| 1357 | 288 | -5760 | 15008 |
| 1358 | -96 | -5824 | 15808 |
| 1359 | -64 | -5392 | 15248 |
| 1360 | 176 | -5776 | 15712 |
| 1361 | 128 | -5632 | 15408 |
| 1362 | 288 | -5584 | 16320 |
| 1363 | 208 | -5424 | 15280 |
| 1364 | -224 | -5344 | 15216 |
| 1365 | -16 | -5488 | 15104 |
| 1366 | 288 | -5584 | 15472 |
| 1367 | -48 | -5776 | 15488 |
| 1368 | 224 | -5840 | 15168 |
| 1369 | 320 | -5904 | 15504 |
| 1370 | -208 | -5744 | 15552 |
| 1371 | 304 | -5968 | 15024 |
| 1372 | 64 | -5680 | 15504 |
| 1373 | 352 | -6032 | 15072 |
| 1374 | -16 | -5280 | 15056 |
| 1375 | -272 | -5568 | 15024 |
| 1376 | -240 | -5424 | 15424 |
| 1377 | 288 | -5392 | 16320 |
| 1378 | 128 | -5840 | 15280 |
| 1379 | -144 | -5984 | 15424 |
| 1380 | -480 | -6032 | 16320 |
| 1381 | -64 | -5696 | 15744 |
| 1382 | 288 | -5584 | 15312 |
| 1383 | -96 | -5440 | 15616 |
| 1384 | 80 | -5712 | 15184 |
| 1385 | 256 | -5568 | 15392 |
| 1386 | -64 | -5344 | 14992 |
| 1387 | -160 | -5680 | 14880 |
| 1388 | 272 | -5312 | 15568 |
| 1389 | -16 | -5872 | 14736 |
| 1390 | 288 | -5792 | 15232 |
| 1391 | -48 | -5584 | 15152 |
| 1392 | -288 | -5872 | 15424 |
| 1393 | 400 | -5360 | 15600 |
| 1394 | 368 | -5296 | 15216 |
| 1395 | -80 | -5280 | 15056 |
| 1396 | -144 | -5920 | 14880 |
| 1397 | -96 | -5648 | 15488 |
| 1398 | -464 | -5584 | 15040 |
| 1399 | 288 | -5888 | 16320 |
| 1400 | 288 | -5824 | 16384 |
| 1401 | 160 | -5360 | 16464 |
| 1402 | -32 | -5408 | 15936 |
| 1403 | 272 | -5872 | 16384 |
| 1404 | -160 | -5360 | 14992 |
| 1405 | 16 | -5456 | 15088 |
| 1406 | -176 | -5904 | 15408 |
| 1407 | 0 | -5968 | 15616 |
| 1408 | 304 | -5584 | 16320 |
| 1409 | 272 | -5824 | 15584 |
| 1410 | 208 | -5472 | 15104 |
| 1411 | -176 | -5440 | 15136 |
| 1412 | -48 | -5904 | 15392 |
| 1413 | 208 | -5504 | 15104 |
| 1414 | 336 | -5936 | 14752 |
| 1415 | 592 | -5792 | 15552 |
| 1416 | 384 | -5840 | 15712 |
| 1417 | 208 | -5504 | 15104 |
| 1418 | 368 | -5584 | 15136 |
| 1419 | 160 | -5632 | 15808 |
| 1420 | -48 | -5376 | 15344 |
| 1421 | 288 | -5776 | 15232 |
| 1422 | -64 | -5424 | 15472 |
| 1423 | -48 | -5584 | 15264 |
| 1424 | -160 | -5904 | 15488 |
| 1425 | 304 | -5952 | 15872 |
| 1426 | 320 | -5472 | 15104 |
| 1427 | -96 | -5392 | 15696 |
| 1428 | -96 | -5552 | 15216 |
| 1429 | 192 | -5840 | 15152 |
| 1430 | -240 | -5600 | 15328 |
| 1431 | 336 | -5488 | 14896 |
| 1432 | 176 | -5904 | 15520 |
| 1433 | 288 | -5376 | 15216 |
| 1434 | -192 | -5408 | 15248 |
| 1435 | -464 | -5392 | 15824 |
| 1436 | 32 | -5328 | 15440 |
| 1437 | -16 | -5808 | 15232 |
| 1438 | -64 | -5424 | 15552 |
| 1439 | 288 | -5584 | 15488 |
| 1440 | -224 | -5744 | 15840 |
| 1441 | -96 | -5424 | 15440 |
| 1442 | 176 | -5840 | 15584 |
| 1443 | -64 | -5440 | 15536 |
| 1444 | 192 | -5712 | 15680 |
| 1445 | -480 | -5360 | 15024 |
| 1446 | 112 | -5248 | 15312 |
| 1447 | -256 | -5904 | 15664 |
| 1448 | -128 | -5440 | 15728 |
| 1449 | -32 | -5488 | 14992 |
| 1450 | -176 | -5904 | 15088 |
| 1451 | -176 | -5472 | 14896 |
| 1452 | 320 | -5872 | 15536 |
| 1453 | -96 | -5632 | 15472 |
| 1454 | -16 | -6000 | 15008 |
| 1455 | 272 | -5600 | 15696 |
| 1456 | 32 | -5520 | 15344 |
| 1457 | 432 | -5840 | 15392 |
| 1458 | -464 | -5696 | 15328 |
| 1459 | -464 | -5424 | 15808 |
| 1460 | -240 | -5408 | 15856 |
| 1461 | 368 | -5824 | 15424 |
| 1462 | 576 | -5712 | 15504 |
| 1463 | 576 | -5456 | 16064 |
| 1464 | -480 | -5392 | 15472 |
| 1465 | 176 | -5616 | 15296 |
| 1466 | 240 | -5568 | 15296 |
| 1467 | -144 | -5824 | 15072 |
| 1468 | 336 | -5600 | 15216 |
| 1469 | 288 | -5840 | 16384 |
| 1470 | 0 | -5648 | 15296 |
| 1471 | 592 | -5984 | 15584 |
| 1472 | -64 | -5712 | 15840 |
| 1473 | -96 | -5712 | 15296 |
| 1474 | -48 | -5440 | 14736 |
| 1475 | -160 | -5376 | 15824 |
| 1476 | 288 | -5344 | 15728 |
| 1477 | 80 | -5584 | 15584 |
| 1478 | 160 | -5312 | 15568 |
| 1479 | 144 | -5792 | 15728 |
| 1480 | 0 | -5712 | 16448 |
| 1481 | 176 | -5808 | 15936 |
| 1482 | -32 | -5360 | 15744 |
| 1483 | 288 | -5536 | 15376 |
| 1484 | -32 | -5872 | 15424 |
| 1485 | 128 | -5888 | 16384 |
| 1486 | 464 | -5776 | 15712 |
| 1487 | 208 | -5648 | 15184 |
| 1488 | -128 | -5600 | 15680 |
| 1489 | 112 | -5504 | 15104 |
| 1490 | -160 | -5360 | 14992 |
| 1491 | 304 | -5824 | 15584 |
| 1492 | -32 | -6096 | 15808 |
| 1493 | 208 | -5728 | 15104 |
| 1494 | 0 | -5712 | 15760 |
| 1495 | 208 | -5440 | 15184 |
| 1496 | -160 | -5648 | 15056 |
| 1497 | -128 | -5408 | 15280 |
| 1498 | -192 | -5728 | 16192 |
| 1499 | 384 | -5584 | 15472 |
| 1500 | -224 | -5840 | 15408 |
| 1501 | -96 | -5760 | 15360 |
| 1502 | 208 | -5472 | 15200 |
| 1503 | 160 | -5536 | 15584 |
| 1504 | 96 | -5888 | 16320 |
| 1505 | 96 | -5312 | 15088 |
| 1506 | -96 | -5872 | 15936 |
| 1507 | -96 | -6096 | 15488 |
| 1508 | -96 | -5312 | 15088 |
| 1509 | 256 | -5712 | 15808 |
| 1510 | -96 | -5904 | 14832 |
| 1511 | -272 | -5824 | 15296 |
| 1512 | -144 | -5360 | 14992 |
| 1513 | 128 | -5312 | 15824 |
| 1514 | -32 | -5248 | 14896 |
| 1515 | 592 | -5360 | 14992 |
| 1516 | 208 | -5648 | 15200 |
| 1517 | 176 | -5472 | 15520 |
| 1518 | -144 | -5856 | 15424 |
| 1519 | -48 | -5984 | 15328 |
| 1520 | -48 | -5952 | 15392 |
| 1521 | 384 | -5424 | 15952 |
| 1522 | 448 | -5312 | 15216 |
| 1523 | -32 | -5360 | 14992 |
| 1524 | -192 | -5392 | 15440 |
| 1525 | 160 | -5248 | 15680 |
| 1526 | -128 | -5712 | 15488 |
| 1527 | 336 | -5872 | 15440 |
| 1528 | -144 | -5312 | 15344 |
| 1529 | -128 | -5616 | 15184 |
| 1530 | 464 | -5280 | 15696 |
| 1531 | 272 | -5776 | 15232 |
| 1532 | 112 | -5600 | 15392 |
| 1533 | 576 | -5536 | 15696 |
| 1534 | 576 | -5792 | 15712 |
| 1535 | -16 | -5440 | 15584 |
| 1536 | -208 | -6016 | 15696 |
| 1537 | -160 | -5536 | 15248 |
| 1538 | 288 | -5424 | 15152 |
| 1539 | 208 | -5696 | 15744 |
| 1540 | -80 | -5312 | 15392 |
| 1541 | -96 | -5808 | 15488 |
| 1542 | 256 | -5728 | 15488 |
| 1543 | 144 | -5984 | 15488 |
| 1544 | -224 | -5328 | 15664 |
| 1545 | 176 | -5808 | 15296 |
| 1546 | 256 | -5696 | 15504 |
| 1547 | -464 | -5792 | 15008 |
| 1548 | -144 | -5376 | 14896 |
| 1549 | -144 | -5968 | 15296 |
| 1550 | 384 | -5680 | 15408 |
| 1551 | 384 | -5824 | 15808 |
| 1552 | -144 | -5584 | 15520 |
| 1553 | -80 | -5520 | 14976 |
| 1554 | -256 | -5968 | 15280 |
| 1555 | -112 | -5648 | 15808 |
| 1556 | -256 | -5424 | 15280 |
| 1557 | -192 | -5648 | 15648 |
| 1558 | 32 | -5312 | 14832 |
| 1559 | -144 | -5808 | 15008 |
| 1560 | -96 | -5840 | 15296 |
| 1561 | 480 | -5552 | 15072 |
| 1562 | 256 | -5712 | 15904 |
| 1563 | 192 | -5360 | 15104 |
| 1564 | -208 | -5280 | 15328 |
| 1565 | 112 | -6000 | 14880 |
| 1566 | 288 | -5312 | 15712 |
| 1567 | 304 | -5776 | 15376 |
| 1568 | -224 | -5696 | 15680 |
| 1569 | 240 | -6032 | 15360 |
| 1570 | 128 | -5680 | 15712 |
| 1571 | -208 | -5568 | 15376 |
| 1572 | -16 | -5184 | 15184 |
| 1573 | 128 | -5504 | 15440 |
| 1574 | -176 | -5360 | 15312 |
| 1575 | -176 | -5504 | 15312 |
| 1576 | 48 | -5904 | 15488 |
| 1577 | -96 | -5744 | 15536 |
| 1578 | 416 | -5440 | 15440 |
| 1579 | -144 | -5584 | 15584 |
| 1580 | 416 | -5888 | 14976 |
| 1581 | 208 | -5744 | 15136 |
| 1582 | 640 | -6032 | 15584 |
| 1583 | 240 | -5952 | 15296 |
| 1584 | -80 | -5360 | 15056 |
| 1585 | 16 | -5872 | 15360 |
| 1586 | 32 | -5824 | 15008 |
| 1587 | -32 | -5376 | 15696 |
| 1588 | 128 | -5696 | 14992 |
| 1589 | -272 | -5712 | 15712 |
| 1590 | 160 | -5872 | 14880 |
| 1591 | 192 | -5920 | 15872 |
| 1592 | -272 | -5472 | 15376 |
| 1593 | -16 | -5792 | 15104 |
| 1594 | -112 | -5328 | 15440 |
| 1595 | 192 | -5744 | 15840 |
| 1596 | 144 | -5792 | 15712 |
| 1597 | 288 | -5504 | 15872 |
| 1598 | 576 | -5984 | 15584 |
| 1599 | -288 | -5360 | 14992 |
| 1600 | -352 | -5952 | 15104 |
| 1601 | 128 | -5360 | 15280 |
| 1602 | -240 | -5424 | 15680 |
| 1603 | -128 | -5808 | 15360 |
| 1604 | 160 | -5808 | 15488 |
| 1605 | 16 | -5248 | 15216 |
| 1606 | 288 | -5616 | 15696 |
| 1607 | 384 | -5584 | 15696 |
| 1608 | 192 | -5360 | 15824 |
| 1609 | 256 | -5744 | 15600 |
| 1610 | -96 | -5296 | 16320 |
| 1611 | -192 | -5840 | 15424 |
| 1612 | -96 | -5712 | 15024 |
| 1613 | 144 | -5888 | 15584 |
| 1614 | 208 | -5760 | 15104 |
| 1615 | 128 | -6144 | 15520 |
| 1616 | 0 | -6096 | 15744 |
| 1617 | -64 | -6048 | 15392 |
| 1618 | 464 | -5184 | 15216 |
| 1619 | -176 | -5984 | 15136 |
| 1620 | -256 | -5808 | 16320 |
| 1621 | 240 | -5920 | 15008 |
| 1622 | 368 | -5680 | 15072 |
| 1623 | -48 | -6096 | 15248 |
| 1624 | -464 | -5280 | 15088 |
| 1625 | -272 | -5872 | 15488 |
| 1626 | -128 | -5424 | 15824 |
| 1627 | 304 | -5840 | 15744 |
| 1628 | -48 | -5824 | 15136 |
| 1629 | -464 | -5584 | 15280 |
| 1630 | 272 | -5824 | 15584 |
| 1631 | -64 | -5824 | 15488 |
| 1632 | 288 | -5888 | 15248 |
| 1633 | 336 | -5744 | 15392 |
| 1634 | 272 | -5872 | 15808 |
| 1635 | -112 | -5904 | 15584 |
| 1636 | -224 | -5840 | 15360 |
| 1637 | -96 | -5840 | 16096 |
| 1638 | 208 | -5728 | 15392 |
| 1639 | 192 | -5424 | 15696 |
| 1640 | -32 | -5360 | 15104 |
| 1641 | -64 | -5840 | 15744 |
| 1642 | 240 | -5584 | 16064 |
| 1643 | 128 | -5904 | 15872 |
| 1644 | 608 | -5984 | 15552 |
| 1645 | -400 | -5648 | 15280 |
| 1646 | 336 | -5408 | 14832 |
| 1647 | -64 | -5472 | 15440 |
| 1648 | -48 | -5376 | 15216 |
| 1649 | 304 | -5408 | 15312 |
| 1650 | -144 | -5968 | 15296 |
| 1651 | 0 | -5728 | 16384 |
| 1652 | -144 | -5248 | 15200 |
| 1653 | -272 | -5728 | 15104 |
| 1654 | -144 | -5280 | 14896 |
| 1655 | 208 | -5792 | 14752 |
| 1656 | 176 | -5712 | 15328 |
| 1657 | 176 | -5808 | 15392 |
| 1658 | 0 | -5248 | 15600 |
| 1659 | 16 | -5728 | 15264 |
| 1660 | -48 | -5744 | 15344 |
| 1661 | 192 | -5376 | 15872 |
| 1662 | -96 | -6000 | 15808 |
| 1663 | 224 | -5376 | 15104 |
| 1664 | -32 | -5872 | 15392 |
| 1665 | 112 | -5648 | 15616 |
| 1666 | 352 | -5424 | 15808 |
| 1667 | -96 | -5648 | 15696 |
| 1668 | -336 | -5536 | 15296 |
| 1669 | -16 | -5600 | 15168 |
| 1670 | 208 | -5360 | 15808 |
| 1671 | -128 | -5920 | 15872 |
| 1672 | 384 | -5152 | 15824 |
| 1673 | 208 | -5760 | 15104 |
| 1674 | 400 | -5616 | 15728 |
| 1675 | -144 | -5648 | 15472 |
| 1676 | 176 | -5296 | 15600 |
| 1677 | 544 | -5280 | 16576 |
| 1678 | -464 | -5856 | 15152 |
| 1679 | 208 | -5792 | 15136 |
| 1680 | -160 | -5648 | 15360 |
| 1681 | 32 | -5568 | 15280 |
| 1682 | -160 | -5296 | 15440 |
| 1683 | 256 | -5376 | 15824 |
| 1684 | -160 | -5392 | 15472 |
| 1685 | -224 | -5600 | 15680 |
| 1686 | 32 | -5376 | 15216 |
| 1687 | 272 | -5824 | 15584 |
| 1688 | 256 | -5904 | 15632 |
| 1689 | 384 | -5440 | 15408 |
| 1690 | -464 | -5392 | 15584 |
| 1691 | 160 | -5456 | 15328 |
| 1692 | 208 | -5696 | 15712 |
| 1693 | 192 | -5648 | 15296 |
| 1694 | -48 | -5472 | 15296 |
| 1695 | 352 | -5488 | 15408 |
| 1696 | 320 | -5952 | 15488 |
| 1697 | -64 | -5584 | 15088 |
| 1698 | 48 | -5840 | 15360 |
| 1699 | -64 | -5408 | 15088 |
| 1700 | 224 | -5504 | 15392 |
| 1701 | 128 | -5600 | 15472 |
| 1702 | 256 | -5280 | 15280 |
| 1703 | 448 | -5648 | 15696 |
| 1704 | -80 | -5648 | 15072 |
| 1705 | -208 | -5792 | 15392 |
| 1706 | 160 | -5728 | 16320 |
| 1707 | -160 | -5392 | 15472 |
| 1708 | 176 | -5792 | 15584 |
| 1709 | -16 | -5056 | 15056 |
| 1710 | 256 | -5712 | 15872 |
| 1711 | 224 | -5632 | 15808 |
| 1712 | -48 | -5968 | 14768 |
| 1713 | -464 | -5360 | 15056 |
| 1714 | 384 | -5760 | 15680 |
| 1715 | -192 | -5376 | 15248 |
| 1716 | -32 | -5376 | 14992 |
| 1717 | -224 | -5392 | 15696 |
| 1718 | -224 | -5456 | 15280 |
| 1719 | 320 | -5472 | 15856 |
| 1720 | 272 | -5824 | 15136 |
| 1721 | 592 | -5952 | 15584 |
| 1722 | -272 | -5360 | 14992 |
| 1723 | -240 | -5872 | 15264 |
| 1724 | -224 | -5552 | 15728 |
| 1725 | -320 | -5584 | 15472 |
| 1726 | -176 | -5664 | 15136 |
| 1727 | 272 | -5760 | 15104 |
| 1728 | -48 | -5408 | 15200 |
| 1729 | 192 | -5312 | 15648 |
| 1730 | -464 | -5424 | 15024 |
| 1731 | 256 | -5792 | 15744 |
| 1732 | 288 | -5840 | 15488 |
| 1733 | 160 | -5808 | 15904 |
| 1734 | -96 | -5648 | 15728 |
| 1735 | 192 | -5584 | 15216 |
| 1736 | 576 | -5824 | 15696 |
| 1737 | 176 | -5728 | 15712 |
| 1738 | 432 | -5712 | 15728 |
| 1739 | -96 | -5584 | 15472 |
| 1740 | -144 | -5280 | 15056 |
| 1741 | 160 | -5680 | 15040 |
| 1742 | 240 | -5744 | 15216 |
| 1743 | 272 | -5296 | 16320 |
| 1744 | 288 | -6080 | 15200 |
| 1745 | -160 | -5312 | 15216 |
| 1746 | 256 | -5728 | 15008 |
| 1747 | -64 | -5440 | 15152 |
| 1748 | -208 | -5712 | 15008 |
| 1749 | 400 | -5824 | 15584 |
| 1750 | 0 | -5920 | 15552 |
| 1751 | -160 | -5984 | 15168 |
| 1752 | -224 | -5360 | 15760 |
| 1753 | 16 | -5376 | 15488 |
| 1754 | 368 | -5408 | 15216 |
| 1755 | 80 | -5296 | 15088 |
| 1756 | 432 | -5712 | 15008 |
| 1757 | 368 | -5920 | 14256 |
| 1758 | 272 | -5632 | 15840 |
| 1759 | -160 | -5328 | 15504 |
| 1760 | 128 | -5744 | 15360 |
| 1761 | 384 | -5920 | 15760 |
| 1762 | 128 | -5664 | 15728 |
| 1763 | 256 | -5376 | 15856 |
| 1764 | -64 | -5616 | 15600 |
| 1765 | 64 | -5184 | 15824 |
| 1766 | 576 | -5792 | 15584 |
| 1767 | 400 | -5792 | 15712 |
| 1768 | -144 | -6048 | 15680 |
| 1769 | -256 | -5632 | 15744 |
| 1770 | -96 | -6000 | 15392 |
| 1771 | -464 | -5392 | 15808 |
| 1772 | 32 | -5392 | 15280 |
| 1773 | 192 | -5824 | 15280 |
| 1774 | 208 | -5744 | 15104 |
| 1775 | 128 | -5648 | 15696 |
| 1776 | 32 | -5344 | 15312 |
| 1777 | -144 | -5968 | 14880 |
| 1778 | 464 | -5696 | 15424 |
| 1779 | -256 | -5600 | 15216 |
| 1780 | 128 | -6096 | 15936 |
| 1781 | 592 | -5824 | 15584 |
| 1782 | -480 | -5424 | 15824 |
| 1783 | -96 | -5648 | 15472 |
| 1784 | -400 | -5760 | 14896 |
| 1785 | 304 | -5520 | 14768 |
| 1786 | -160 | -5664 | 15024 |
| 1787 | -32 | -5360 | 14992 |
| 1788 | -224 | -5776 | 15488 |
| 1789 | 272 | -5824 | 15584 |
| 1790 | 208 | -5792 | 15136 |
| 1791 | 0 | -5984 | 15696 |
| 1792 | -400 | -5248 | 15184 |
| 1793 | -80 | -5904 | 16032 |
| 1794 | 112 | -5824 | 15568 |
| 1795 | 400 | -5824 | 15552 |
| 1796 | 384 | -5616 | 15040 |
| 1797 | 96 | -5504 | 15104 |
| 1798 | -224 | -5808 | 15920 |
| 1799 | 384 | -5824 | 15136 |
| 1800 | -80 | -5184 | 15552 |
| 1801 | -80 | -5440 | 15216 |
| 1802 | 16 | -5872 | 15904 |
| 1803 | 288 | -5424 | 15856 |
| 1804 | -48 | -5744 | 15088 |
| 1805 | 512 | -5280 | 15824 |
| 1806 | 288 | -5984 | 16320 |
| 1807 | -96 | -5184 | 15152 |
| 1808 | -144 | -5360 | 14992 |
| 1809 | -352 | -5856 | 16320 |
| 1810 | -176 | -5376 | 15088 |
| 1811 | -480 | -5424 | 14992 |
| 1812 | 240 | -5840 | 15136 |
| 1813 | 128 | -5424 | 15440 |
| 1814 | -112 | -5984 | 15360 |
| 1815 | 512 | -5584 | 15280 |
| 1816 | -336 | -5296 | 15488 |
| 1817 | 128 | -5664 | 15712 |
| 1818 | -464 | -5424 | 15808 |
| 1819 | 32 | -5984 | 16320 |
| 1820 | 416 | -5664 | 16320 |
| 1821 | -96 | -5648 | 15472 |
| 1822 | 0 | -5936 | 14768 |
| 1823 | -96 | -5280 | 15808 |
| 1824 | -240 | -5376 | 15280 |
| 1825 | 32 | -6096 | 15568 |
| 1826 | 448 | -5536 | 15088 |
| 1827 | -160 | -5424 | 15472 |
| 1828 | 112 | -5360 | 14992 |
| 1829 | -336 | -5488 | 15248 |
| 1830 | -240 | -5312 | 15840 |
| 1831 | 384 | -5728 | 15808 |
| 1832 | -144 | -6096 | 15328 |
| 1833 | 352 | -5824 | 14976 |
| 1834 | -160 | -5776 | 15008 |
| 1835 | -144 | -5568 | 15184 |
| 1836 | 256 | -6032 | 15392 |
| 1837 | 272 | -5984 | 15584 |
| 1838 | 272 | -6016 | 15136 |
| 1839 | -64 | -5408 | 15280 |
| 1840 | 400 | -5792 | 15712 |
| 1841 | -400 | -5952 | 15232 |
| 1842 | -144 | -5536 | 15696 |
| 1843 | 416 | -5376 | 15424 |
| 1844 | 48 | -5840 | 15392 |
| 1845 | 160 | -5856 | 15280 |
| 1846 | 496 | -5888 | 15280 |
| 1847 | 208 | -5504 | 15392 |
| 1848 | -64 | -5680 | 15136 |
| 1849 | -144 | -5584 | 16096 |
| 1850 | -128 | -5376 | 15248 |
| 1851 | 192 | -5872 | 15872 |
| 1852 | -304 | -5472 | 15184 |
| 1853 | 208 | -5696 | 15104 |
| 1854 | -464 | -5616 | 15728 |
| 1855 | 256 | -5904 | 15840 |
| 1856 | 288 | -5776 | 15504 |
| 1857 | 288 | -5632 | 15280 |
| 1858 | -224 | -5488 | 15472 |
| 1859 | -256 | -5312 | 16336 |
| 1860 | -96 | -5312 | 15472 |
| 1861 | -272 | -5760 | 15296 |
| 1862 | 272 | -5760 | 15136 |
| 1863 | -128 | -5600 | 15600 |
| 1864 | 128 | -5776 | 15712 |
| 1865 | -32 | -5424 | 15824 |
| 1866 | -32 | -5872 | 16320 |
| 1867 | -16 | -5632 | 14704 |
| 1868 | 272 | -5824 | 15136 |
| 1869 | 272 | -5984 | 15584 |
| 1870 | 208 | -5632 | 15424 |
| 1871 | 208 | -5792 | 15104 |
| 1872 | 208 | -5296 | 15216 |
| 1873 | -160 | -5360 | 14992 |
| 1874 | 208 | -5888 | 15136 |
| 1875 | 208 | -5984 | 15136 |
| 1876 | -464 | -5696 | 15744 |
| 1877 | 368 | -6048 | 15008 |
| 1878 | -48 | -5808 | 15488 |
| 1879 | -160 | -5360 | 14992 |
| 1880 | -144 | -5184 | 15088 |
| 1881 | -192 | -5248 | 15696 |
| 1882 | 464 | -5808 | 15840 |
| 1883 | 304 | -5840 | 14928 |
| 1884 | -160 | -5360 | 14992 |
| 1885 | 272 | -5824 | 15744 |
| 1886 | -480 | -5424 | 15824 |
| 1887 | 192 | -5600 | 15744 |
| 1888 | 352 | -5424 | 14768 |
| 1889 | -272 | -5584 | 14704 |
| 1890 | 416 | -5792 | 16384 |
| 1891 | 128 | -5408 | 15280 |
| 1892 | 208 | -5824 | 15136 |
| 1893 | -48 | -5888 | 15024 |
| 1894 | 224 | -5488 | 15024 |
| 1895 | 240 | -5760 | 15600 |
| 1896 | 0 | -5440 | 15328 |
| 1897 | -336 | -5872 | 15504 |
| 1898 | -192 | -5792 | 15584 |
| 1899 | 208 | -5632 | 15136 |
| 1900 | -128 | -5856 | 15360 |
| 1901 | -208 | -5488 | 15408 |
| 1902 | -256 | -5904 | 15696 |
| 1903 | -80 | -5584 | 15440 |
| 1904 | -240 | -5840 | 15392 |
| 1905 | -32 | -5232 | 14864 |
| 1906 | 192 | -5904 | 15232 |
| 1907 | 336 | -5376 | 15184 |
| 1908 | -128 | -5584 | 15472 |
| 1909 | -176 | -5248 | 15072 |
| 1910 | -48 | -5808 | 15216 |
| 1911 | 32 | -5904 | 15520 |
| 1912 | -128 | -5760 | 15024 |
| 1913 | 416 | -5312 | 15216 |
| 1914 | 288 | -5504 | 15424 |
| 1915 | -176 | -5488 | 15520 |
| 1916 | -176 | -5712 | 15584 |
| 1917 | -32 | -5360 | 14992 |
| 1918 | 272 | -5824 | 15136 |
| 1919 | 336 | -5824 | 15136 |
| 1920 | -32 | -5232 | 14992 |
| 1921 | 384 | -6000 | 16320 |
| 1922 | -304 | -5584 | 15184 |
| 1923 | 256 | -5744 | 15488 |
| 1924 | 384 | -5696 | 16384 |
| 1925 | 208 | -5616 | 15344 |
| 1926 | 16 | -5488 | 15248 |
| 1927 | 576 | -5792 | 15584 |
| 1928 | 256 | -5344 | 15728 |
| 1929 | -224 | -5920 | 15808 |
| 1930 | 128 | -5648 | 15712 |
| 1931 | 272 | -5824 | 15584 |
| 1932 | 208 | -5728 | 15104 |
| 1933 | -256 | -5616 | 15728 |
| 1934 | -128 | -5648 | 15472 |
| 1935 | -16 | -5424 | 15328 |
| 1936 | 160 | -5824 | 15520 |
| 1937 | 304 | -5904 | 15008 |
| 1938 | -32 | -5904 | 15520 |
| 1939 | 464 | -5248 | 15808 |
| 1940 | -96 | -5392 | 15472 |
| 1941 | 128 | -5984 | 15904 |
| 1942 | 48 | -5408 | 15296 |
| 1943 | 0 | -5648 | 15472 |
| 1944 | 304 | -5680 | 14816 |
| 1945 | -128 | -5584 | 15216 |
| 1946 | 16 | -5728 | 15024 |
| 1947 | 128 | -5968 | 15808 |
| 1948 | 400 | -6080 | 15296 |
| 1949 | -96 | -5968 | 15488 |
| 1950 | 288 | -5744 | 14736 |
| 1951 | 256 | -5712 | 16384 |
| 1952 | 416 | -5728 | 15152 |
| 1953 | 208 | -5408 | 15168 |
| 1954 | 288 | -5456 | 15936 |
| 1955 | 32 | -5712 | 15392 |
| 1956 | 400 | -5792 | 15712 |
| 1957 | 416 | -5472 | 16448 |
| 1958 | -240 | -5824 | 15136 |
| 1959 | -144 | -6048 | 14736 |
| 1960 | -80 | -5792 | 15296 |
| 1961 | -32 | -5424 | 14992 |
| 1962 | -176 | -5888 | 15424 |
| 1963 | -336 | -5568 | 15424 |
| 1964 | 384 | -5856 | 15520 |
| 1965 | -496 | -5488 | 15440 |
| 1966 | 256 | -5648 | 15536 |
| 1967 | -208 | -5920 | 15136 |
| 1968 | -176 | -5536 | 15216 |
| 1969 | 464 | -5568 | 15216 |
| 1970 | 0 | -5584 | 15808 |
| 1971 | 192 | -5648 | 15104 |
| 1972 | -208 | -5968 | 15328 |
| 1973 | 16 | -5872 | 15488 |
| 1974 | 272 | -5888 | 15584 |
| 1975 | -208 | -5984 | 15008 |
| 1976 | 592 | -5984 | 15584 |
| 1977 | -112 | -5920 | 15360 |
| 1978 | -112 | -5456 | 15248 |
| 1979 | -96 | -5936 | 15360 |
| 1980 | 336 | -5424 | 15280 |
| 1981 | 288 | -5584 | 15088 |
| 1982 | -16 | -5056 | 15216 |
| 1983 | 160 | -5840 | 14992 |
| 1984 | -160 | -5424 | 15824 |
| 1985 | -16 | -5376 | 15120 |
| 1986 | -176 | -5456 | 15184 |
| 1987 | 0 | -5648 | 15728 |
| 1988 | 160 | -5312 | 15088 |
| 1989 | 352 | -5936 | 15040 |
| 1990 | 256 | -5760 | 15936 |
| 1991 | 464 | -5664 | 15472 |
| 1992 | 32 | -5648 | 15728 |
| 1993 | 384 | -5792 | 15712 |
| 1994 | -224 | -5504 | 15248 |
| 1995 | 320 | -5808 | 15680 |
| 1996 | 288 | -5648 | 15440 |
| 1997 | -16 | -5728 | 15360 |
| 1998 | 384 | -5424 | 15216 |
| 1999 | -256 | -5456 | 15136 |
| 2000 | -96 | -5424 | 14896 |
| 2001 | -80 | -5632 | 15360 |
| 2002 | -96 | -5136 | 15536 |
| 2003 | -480 | -5664 | 15600 |
| 2004 | 288 | -5712 | 16352 |
| 2005 | 208 | -5904 | 15424 |
| 2006 | -160 | -5296 | 14992 |
| 2007 | 16 | -5248 | 15728 |
| 2008 | 240 | -5920 | 15296 |
| 2009 | 288 | -5792 | 15136 |
| 2010 | -128 | -5792 | 15712 |
| 2011 | 480 | -5600 | 15184 |
| 2012 | 640 | -5216 | 15696 |
| 2013 | -64 | -5472 | 15568 |
| 2014 | -32 | -5328 | 14992 |
| 2015 | 272 | -5824 | 15136 |
| 2016 | -160 | -5360 | 15824 |
| 2017 | -160 | -6000 | 15424 |
| 2018 | 464 | -5616 | 15296 |
| 2019 | -16 | -5248 | 14896 |
| 2020 | 288 | -5760 | 15488 |
| 2021 | 112 | -5584 | 15152 |
| 2022 | -144 | -5840 | 15488 |
| 2023 | -144 | -5696 | 15360 |
| 2024 | -64 | -5808 | 15408 |
| 2025 | 272 | -5824 | 15584 |
| 2026 | 288 | -6048 | 15008 |
| 2027 | 304 | -6096 | 15328 |
| 2028 | 272 | -5728 | 15808 |
| 2029 | 0 | -5904 | 15008 |
| 2030 | -160 | -5392 | 15952 |
| 2031 | -272 | -5504 | 15152 |
| 2032 | 208 | -5744 | 15104 |
| 2033 | 432 | -5680 | 15392 |
| 2034 | 352 | -5728 | 15360 |
| 2035 | 64 | -5936 | 15488 |
| 2036 | -192 | -5424 | 15472 |
| 2037 | 272 | -5904 | 15072 |
| 2038 | 320 | -5904 | 15408 |
| 2039 | -48 | -5344 | 15216 |
| 2040 | 384 | -5824 | 15520 |
| 2041 | 208 | -5504 | 15104 |
| 2042 | 128 | -5520 | 16320 |
| 2043 | -176 | -5584 | 15152 |
| 2044 | 384 | -5920 | 16320 |
| 2045 | -160 | -5328 | 14992 |
| 2046 | -224 | -5376 | 15568 |
| 2047 | 208 | -5824 | 15328 |
| 2048 | 272 | -5824 | 15136 |
| 2049 | 208 | -5728 | 15104 |
| 2050 | 272 | -5504 | 15024 |
| 2051 | 112 | -5568 | 15088 |
| 2052 | 128 | -5680 | 15296 |
| 2053 | 304 | -5440 | 15280 |
| 2054 | 208 | -5568 | 15072 |
| 2055 | 240 | -5376 | 15728 |
| 2056 | -48 | -5424 | 15088 |
| 2057 | 576 | -5696 | 15600 |
| 2058 | -64 | -5600 | 15952 |
| 2059 | 256 | -5584 | 15680 |
| 2060 | 16 | -5488 | 15280 |
| 2061 | -32 | -5872 | 15328 |
| 2062 | 272 | -5792 | 15584 |
| 2063 | 176 | -5888 | 15328 |
| 2064 | 320 | -5440 | 15152 |
| 2065 | -176 | -5440 | 15152 |
| 2066 | -144 | -6112 | 15424 |
| 2067 | -144 | -5392 | 14768 |
| 2068 | -80 | -5904 | 15104 |
| 2069 | -96 | -5648 | 15472 |
| 2070 | 448 | -5392 | 15280 |
| 2071 | -464 | -5824 | 15360 |
| 2072 | 288 | -5488 | 15872 |
| 2073 | -80 | -5392 | 14992 |
| 2074 | 160 | -5424 | 15504 |
| 2075 | 160 | -5792 | 15360 |
| 2076 | -192 | -5904 | 15008 |
| 2077 | 592 | -5824 | 15552 |
| 2078 | -96 | -5648 | 15728 |
| 2079 | 176 | -5312 | 15360 |
| 2080 | -480 | -5360 | 14992 |
| 2081 | 384 | -6016 | 15744 |
| 2082 | 176 | -5792 | 15712 |
| 2083 | 288 | -5984 | 15872 |
| 2084 | -96 | -5648 | 15472 |
| 2085 | -176 | -5632 | 15136 |
| 2086 | 128 | -5168 | 15696 |
| 2087 | 80 | -5552 | 15408 |
| 2088 | 208 | -5312 | 15184 |
| 2089 | 0 | -5296 | 15680 |
| 2090 | 576 | -5648 | 15680 |
| 2091 | 144 | -5488 | 15584 |
| 2092 | -48 | -5568 | 15296 |
| 2093 | -464 | -5840 | 15152 |
| 2094 | 272 | -5984 | 15584 |
| 2095 | 160 | -5360 | 15696 |
| 2096 | 160 | -5792 | 15360 |
| 2097 | 160 | -5808 | 15488 |
| 2098 | -128 | -5840 | 15680 |
| 2099 | 0 | -5472 | 15696 |
| 2100 | -480 | -5328 | 15056 |
| 2101 | 176 | -5696 | 15792 |
| 2102 | -464 | -5344 | 14992 |
| 2103 | -64 | -4880 | 15408 |
| 2104 | -16 | -5552 | 16448 |
| 2105 | -304 | -6016 | 16320 |
| 2106 | 320 | -5920 | 15328 |
| 2107 | -64 | -5632 | 15360 |
| 2108 | 160 | -5680 | 15232 |
| 2109 | -32 | -5360 | 14992 |
| 2110 | 0 | -5584 | 15472 |
| 2111 | 240 | -5216 | 15088 |
| 2112 | -192 | -5472 | 15184 |
| 2113 | 384 | -5792 | 15712 |
| 2114 | -16 | -5504 | 15104 |
| 2115 | 32 | -5392 | 15296 |
| 2116 | -144 | -5648 | 15088 |
| 2117 | 272 | -5520 | 15840 |
| 2118 | 256 | -5504 | 15840 |
| 2119 | 112 | -5872 | 15680 |
| 2120 | -32 | -5408 | 14992 |
| 2121 | 336 | -5248 | 15152 |
| 2122 | 416 | -5648 | 15712 |
| 2123 | 304 | -5792 | 15808 |
| 2124 | 464 | -5296 | 15184 |
| 2125 | -272 | -5360 | 14992 |
| 2126 | -208 | -5712 | 15328 |
| 2127 | 32 | -5920 | 16320 |
| 2128 | 256 | -5808 | 15680 |
| 2129 | 144 | -5712 | 16320 |
| 2130 | -160 | -5392 | 15312 |
| 2131 | 640 | -5824 | 15584 |
| 2132 | -128 | -5584 | 15472 |
| 2133 | -16 | -5472 | 15328 |
| 2134 | 192 | -5824 | 15872 |
| 2135 | 192 | -5840 | 15808 |
| 2136 | 160 | -5776 | 15728 |
| 2137 | -80 | -5776 | 14976 |
| 2138 | -208 | -5744 | 15408 |
| 2139 | 208 | -5760 | 15104 |
| 2140 | 208 | -5504 | 15104 |
| 2141 | 160 | -6096 | 15488 |
| 2142 | 176 | -5616 | 14896 |
| 2143 | 592 | -5792 | 15584 |
| 2144 | -304 | -5888 | 15248 |
| 2145 | 160 | -5568 | 16064 |
| 2146 | 208 | -5504 | 15104 |
| 2147 | -64 | -5360 | 15216 |
| 2148 | -160 | -5328 | 16320 |
| 2149 | -176 | -5520 | 15216 |
| 2150 | -48 | -5968 | 14752 |
| 2151 | 192 | -5584 | 15520 |
| 2152 | -176 | -5648 | 15088 |
| 2153 | 256 | -5968 | 15744 |
| 2154 | 288 | -5760 | 15168 |
| 2155 | 208 | -5888 | 15136 |
| 2156 | 576 | -5872 | 15600 |
| 2157 | -352 | -5808 | 15744 |
| 2158 | 256 | -5872 | 15136 |
| 2159 | -384 | -5376 | 15808 |
| 2160 | 192 | -5280 | 15728 |
| 2161 | 208 | -5488 | 15696 |
| 2162 | 192 | -5504 | 15104 |
| 2163 | 80 | -5376 | 15344 |
| 2164 | -464 | -5680 | 15216 |
| 2165 | 336 | -5872 | 15232 |
| 2166 | 208 | -5568 | 15104 |
| 2167 | 336 | -6080 | 15264 |
| 2168 | 80 | -5712 | 15360 |
| 2169 | -160 | -5376 | 15440 |
| 2170 | 176 | -5792 | 15712 |
| 2171 | 256 | -5472 | 15680 |
| 2172 | -16 | -5584 | 14768 |
| 2173 | 128 | -5392 | 15808 |
| 2174 | -256 | -5888 | 15424 |
| 2175 | 208 | -5728 | 15104 |
| 2176 | -160 | -5536 | 15024 |
| 2177 | -96 | -5648 | 15472 |
| 2178 | 432 | -5792 | 15392 |
| 2179 | -64 | -5872 | 15376 |
| 2180 | 304 | -5424 | 15088 |
| 2181 | 592 | -5792 | 15584 |
| 2182 | -64 | -5584 | 15600 |
| 2183 | 160 | -5904 | 15520 |
| 2184 | 256 | -5312 | 15744 |
| 2185 | 288 | -5424 | 15424 |
| 2186 | 112 | -5712 | 15568 |
| 2187 | 160 | -5440 | 15376 |
| 2188 | 288 | -5568 | 15680 |
| 2189 | -64 | -5424 | 15312 |
| 2190 | -288 | -5360 | 14992 |
| 2191 | -256 | -5824 | 15488 |
| 2192 | -64 | -5424 | 15696 |
| 2193 | 384 | -5584 | 15472 |
| 2194 | -464 | -6096 | 15136 |
| 2195 | 464 | -5392 | 15312 |
| 2196 | 384 | -5792 | 15584 |
| 2197 | 288 | -5216 | 15184 |
| 2198 | 32 | -5584 | 15696 |
| 2199 | 208 | -5264 | 15184 |
| 2200 | 192 | -5920 | 15440 |
| 2201 | 224 | -5344 | 14992 |
| 2202 | -96 | -6160 | 15456 |
| 2203 | -160 | -5424 | 15440 |
| 2204 | 320 | -5472 | 15184 |
| 2205 | -464 | -5360 | 15248 |
| 2206 | -144 | -5312 | 14896 |
| 2207 | -96 | -5392 | 15728 |
| 2208 | -64 | -5984 | 15296 |
| 2209 | -64 | -5568 | 15584 |
| 2210 | 272 | -5840 | 15440 |
| 2211 | -96 | -5744 | 15360 |
| 2212 | 288 | -5792 | 15712 |
| 2213 | -160 | -5792 | 15584 |
| 2214 | 320 | -5552 | 15696 |
| 2215 | 576 | -5792 | 15584 |
| 2216 | 448 | -5392 | 15696 |
| 2217 | -176 | -5328 | 15056 |
| 2218 | 256 | -5856 | 15536 |
| 2219 | 400 | -5280 | 15216 |
| 2220 | -128 | -6096 | 15840 |
| 2221 | 48 | -5776 | 15360 |
| 2222 | 112 | -5920 | 15360 |
| 2223 | 288 | -5856 | 15520 |
| 2224 | -144 | -5344 | 15088 |
| 2225 | -32 | -5360 | 14992 |
| 2226 | -304 | -5664 | 15456 |
| 2227 | 32 | -5792 | 15152 |
| 2228 | 256 | -5264 | 15696 |
| 2229 | 160 | -5568 | 14768 |
| 2230 | 208 | -5824 | 15136 |
| 2231 | 32 | -5440 | 15680 |
| 2232 | -48 | -6000 | 15392 |
| 2233 | 304 | -5824 | 15584 |
| 2234 | 128 | -5696 | 15504 |
| 2235 | 208 | -5824 | 15072 |
| 2236 | -224 | -5600 | 15680 |
| 2237 | 256 | -5408 | 15680 |
| 2238 | 176 | -5824 | 15168 |
| 2239 | -208 | -5472 | 15360 |
| 2240 | -336 | -5504 | 15168 |
| 2241 | -144 | -5440 | 15440 |
| 2242 | -48 | -6080 | 15296 |
| 2243 | -144 | -5840 | 14976 |
| 2244 | -96 | -5648 | 15472 |
| 2245 | -176 | -5984 | 15360 |
| 2246 | 352 | -5600 | 15168 |
| 2247 | 240 | -5344 | 15184 |
| 2248 | 192 | -5744 | 15488 |
| 2249 | -48 | -5392 | 15328 |
| 2250 | 256 | -5792 | 15424 |
| 2251 | -160 | -5392 | 14992 |
| 2252 | -16 | -5600 | 15008 |
| 2253 | 48 | -5488 | 15008 |
| 2254 | -16 | -5840 | 15152 |
| 2255 | -48 | -5792 | 14880 |
| 2256 | 288 | -5856 | 15296 |
| 2257 | 336 | -5280 | 15216 |
| 2258 | -128 | -5920 | 15376 |
| 2259 | 288 | -5888 | 15248 |
| 2260 | -16 | -5360 | 15344 |
| 2261 | -64 | -6112 | 15744 |
| 2262 | 368 | -5584 | 15056 |
| 2263 | -80 | -5664 | 15328 |
| 2264 | -336 | -5904 | 15328 |
| 2265 | 224 | -5264 | 14880 |
| 2266 | 288 | -5712 | 15216 |
| 2267 | 288 | -5440 | 15696 |
| 2268 | 288 | -5728 | 15712 |
| 2269 | 288 | -5440 | 15184 |
| 2270 | -512 | -5728 | 15728 |
| 2271 | 144 | -5824 | 15232 |
| 2272 | 176 | -5840 | 15712 |
| 2273 | -256 | -5584 | 16336 |
| 2274 | 0 | -5248 | 16080 |
| 2275 | 176 | -5696 | 15328 |
| 2276 | 112 | -5584 | 15328 |
| 2277 | 192 | -5920 | 15280 |
| 2278 | -144 | -5504 | 15072 |
| 2279 | 352 | -5824 | 15264 |
| 2280 | -208 | -5856 | 15696 |
| 2281 | 288 | -5568 | 15680 |
| 2282 | -112 | -5712 | 15696 |
| 2283 | 304 | -5520 | 15136 |
| 2284 | -320 | -5856 | 15808 |
| 2285 | 32 | -5568 | 15488 |
| 2286 | 368 | -5568 | 15392 |
| 2287 | 208 | -5504 | 15104 |
| 2288 | 208 | -5616 | 15136 |
| 2289 | 176 | -5696 | 15872 |
| 2290 | 32 | -5824 | 15488 |
| 2291 | -176 | -6048 | 15392 |
| 2292 | 336 | -5904 | 14736 |
| 2293 | 272 | -5792 | 15584 |
| 2294 | 128 | -5712 | 15744 |
| 2295 | -176 | -5808 | 14736 |
| 2296 | -304 | -5568 | 15104 |
| 2297 | -464 | -5392 | 15824 |
| 2298 | 304 | -5328 | 15088 |
| 2299 | -32 | -5376 | 14992 |
| 2300 | 320 | -5568 | 15136 |
| 2301 | 272 | -5424 | 15312 |
| 2302 | -224 | -5712 | 16320 |
| 2303 | 96 | -5360 | 14992 |
| 2304 | -96 | -5856 | 16000 |
| 2305 | 576 | -5392 | 15408 |
| 2306 | 144 | -5616 | 15280 |
| 2307 | 160 | -5616 | 16320 |
| 2308 | -224 | -5584 | 15712 |
| 2309 | 384 | -5808 | 15424 |
| 2310 | 16 | -6032 | 15392 |
| 2311 | 112 | -5536 | 15280 |
| 2312 | 576 | -5616 | 14896 |
| 2313 | 384 | -5792 | 15584 |
| 2314 | 208 | -5824 | 15584 |
| 2315 | 192 | -5584 | 15248 |
| 2316 | 160 | -5904 | 15504 |
| 2317 | 160 | -5392 | 15952 |
| 2318 | 592 | -5904 | 15584 |
| 2319 | 336 | -5232 | 14896 |
| 2320 | -16 | -5584 | 15120 |
| 2321 | 336 | -5888 | 15696 |
| 2322 | -464 | -5472 | 15424 |
| 2323 | 352 | -5168 | 15440 |
| 2324 | -272 | -5584 | 15264 |
| 2325 | -16 | -5648 | 15328 |
| 2326 | -96 | -5936 | 15424 |
| 2327 | 336 | -5904 | 14880 |
| 2328 | 512 | -5392 | 15600 |
| 2329 | -32 | -5888 | 15360 |
| 2330 | -240 | -5440 | 15776 |
| 2331 | -48 | -5344 | 15088 |
| 2332 | 128 | -5296 | 15856 |
| 2333 | 192 | -5280 | 15536 |
| 2334 | 160 | -5648 | 15728 |
| 2335 | 576 | -5568 | 14880 |
| 2336 | 0 | -5824 | 15488 |
| 2337 | 208 | -5504 | 15104 |
| 2338 | 176 | -5952 | 15296 |
| 2339 | 208 | -5408 | 15584 |
| 2340 | 128 | -5568 | 15680 |
| 2341 | 256 | -5776 | 15280 |
| 2342 | -160 | -5424 | 15808 |
| 2343 | 592 | -5696 | 15552 |
| 2344 | 384 | -5776 | 15840 |
| 2345 | 288 | -5760 | 15552 |
| 2346 | 304 | -5408 | 15344 |
| 2347 | 208 | -5824 | 15136 |
| 2348 | 288 | -5712 | 15488 |
| 2349 | 400 | -5584 | 15808 |
| 2350 | 256 | -5968 | 15584 |
| 2351 | -464 | -5504 | 15584 |
| 2352 | 32 | -5312 | 15344 |
| 2353 | -96 | -5584 | 15472 |
| 2354 | 160 | -5616 | 15344 |
| 2355 | 336 | -5856 | 15136 |
| 2356 | 304 | -5424 | 15440 |
| 2357 | 32 | -5840 | 15456 |
| 2358 | 64 | -6096 | 15328 |
| 2359 | -496 | -5376 | 15056 |
| 2360 | 192 | -5888 | 15488 |
| 2361 | 208 | -5728 | 15104 |
| 2362 | -80 | -5520 | 15072 |
| 2363 | 32 | -5328 | 16336 |
| 2364 | -464 | -5776 | 15088 |
| 2365 | -144 | -5520 | 14896 |
| 2366 | 160 | -5584 | 15488 |
| 2367 | 480 | -5632 | 15808 |
| 2368 | 272 | -5744 | 15280 |
| 2369 | 240 | -5312 | 15216 |
| 2370 | 208 | -5392 | 15568 |
| 2371 | 240 | -5840 | 16064 |
| 2372 | 192 | -5376 | 14992 |
| 2373 | -144 | -5968 | 15296 |
| 2374 | -48 | -5632 | 15104 |
| 2375 | -144 | -5504 | 15168 |
| 2376 | -464 | -5888 | 16320 |
| 2377 | -96 | -5808 | 16320 |
| 2378 | 448 | -6080 | 15248 |
| 2379 | 576 | -5648 | 15824 |
| 2380 | 336 | -5648 | 15552 |
| 2381 | -144 | -5440 | 15392 |
| 2382 | 336 | -5360 | 15088 |
| 2383 | -160 | -5056 | 15280 |
| 2384 | 112 | -6032 | 15424 |
| 2385 | -48 | -5648 | 15808 |
| 2386 | -208 | -5744 | 15168 |
| 2387 | 352 | -6096 | 15264 |
| 2388 | 256 | -5360 | 16320 |
| 2389 | -240 | -5856 | 15488 |
| 2390 | -32 | -5840 | 15392 |
| 2391 | 352 | -5264 | 15136 |
| 2392 | -80 | -5504 | 15056 |
| 2393 | 128 | -5648 | 15472 |
| 2394 | 208 | -5776 | 15264 |
| 2395 | 96 | -5584 | 15664 |
| 2396 | 176 | -5456 | 15344 |
| 2397 | 272 | -5872 | 15760 |
| 2398 | 208 | -5760 | 15104 |
| 2399 | 272 | -5840 | 15712 |
| 2400 | -480 | -5568 | 14992 |
| 2401 | -464 | -5696 | 15840 |
| 2402 | 112 | -6048 | 15008 |
| 2403 | -224 | -5184 | 15472 |
| 2404 | 288 | -5616 | 15696 |
| 2405 | -144 | -5408 | 15216 |
| 2406 | -256 | -5568 | 15680 |
| 2407 | 272 | -6096 | 15488 |
| 2408 | 256 | -5936 | 15488 |
| 2409 | 368 | -5120 | 15216 |
| 2410 | 384 | -5680 | 15216 |
| 2411 | -176 | -5744 | 15424 |
| 2412 | -48 | -5568 | 15312 |
| 2413 | -48 | -5808 | 14752 |
| 2414 | 512 | -5616 | 15504 |
| 2415 | 368 | -6000 | 14896 |
| 2416 | 112 | -5520 | 15088 |
| 2417 | -48 | -5856 | 15280 |
| 2418 | -96 | -5968 | 15808 |
| 2419 | 336 | -5440 | 15568 |
| 2420 | 384 | -6096 | 15248 |
| 2421 | -176 | -5328 | 15152 |
| 2422 | -48 | -5104 | 15216 |
| 2423 | 416 | -5440 | 15440 |
| 2424 | -32 | -5360 | 14992 |
| 2425 | 256 | -5552 | 15728 |
| 2426 | 16 | -5632 | 15408 |
| 2427 | 288 | -5280 | 15696 |
| 2428 | 240 | -5776 | 15296 |
| 2429 | -224 | -5856 | 14720 |
| 2430 | 576 | -5344 | 15744 |
| 2431 | -464 | -5600 | 15904 |
| 2432 | -48 | -5360 | 14768 |
| 2433 | -96 | -5616 | 15024 |
| 2434 | 80 | -5232 | 15216 |
| 2435 | -176 | -5808 | 15264 |
| 2436 | 592 | -5824 | 15584 |
| 2437 | 128 | -5456 | 16080 |
| 2438 | -208 | -5744 | 15376 |
| 2439 | 240 | -5792 | 15232 |
| 2440 | 496 | -5456 | 15152 |
| 2441 | -352 | -5792 | 15392 |
| 2442 | -224 | -5904 | 15408 |
| 2443 | 512 | -5872 | 16320 |
| 2444 | 208 | -5968 | 15328 |
| 2445 | -192 | -5424 | 15440 |
| 2446 | 368 | -5424 | 15024 |
| 2447 | 160 | -5936 | 15280 |
| 2448 | -256 | -5280 | 15760 |
| 2449 | 192 | -5792 | 15840 |
| 2450 | 464 | -5456 | 15552 |
| 2451 | -80 | -5808 | 15424 |
| 2452 | 352 | -5600 | 14896 |
| 2453 | -80 | -5328 | 15296 |
| 2454 | 336 | -5488 | 15152 |
| 2455 | -80 | -5728 | 14736 |
| 2456 | -464 | -5472 | 15440 |
| 2457 | -144 | -5632 | 15296 |
| 2458 | 256 | -5952 | 15488 |
| 2459 | -64 | -5584 | 15600 |
| 2460 | 144 | -5360 | 15600 |
| 2461 | 208 | -5376 | 15216 |
| 2462 | 512 | -5568 | 15696 |
| 2463 | 160 | -5808 | 15552 |
| 2464 | 176 | -5584 | 14768 |
| 2465 | 128 | -5648 | 15472 |
| 2466 | 256 | -6032 | 14976 |
| 2467 | -144 | -5248 | 15152 |
| 2468 | -16 | -5488 | 14992 |
| 2469 | 288 | -5744 | 15696 |
| 2470 | 96 | -5728 | 15440 |
| 2471 | 96 | -5584 | 15296 |
| 2472 | 448 | -5296 | 15248 |
| 2473 | -240 | -5648 | 15408 |
| 2474 | 384 | -6000 | 15536 |
| 2475 | -16 | -5376 | 14992 |
| 2476 | -160 | -5424 | 15808 |
| 2477 | 352 | -5312 | 15392 |
| 2478 | 512 | -5296 | 16448 |
| 2479 | -112 | -5968 | 15360 |
| 2480 | -80 | -5424 | 15328 |
| 2481 | 272 | -5264 | 15152 |
| 2482 | 320 | -5760 | 15424 |
| 2483 | -272 | -5568 | 15424 |
| 2484 | -16 | -5712 | 15568 |
| 2485 | 160 | -5776 | 15520 |
| 2486 | -176 | -5616 | 15328 |
| 2487 | -272 | -5248 | 15808 |
| 2488 | -320 | -5536 | 14976 |
| 2489 | 192 | -5456 | 15184 |
| 2490 | 608 | -5616 | 15952 |
| 2491 | -32 | -5616 | 15600 |
| 2492 | -48 | -5632 | 15280 |
| 2493 | 160 | -5392 | 15600 |
| 2494 | 288 | -6000 | 15520 |
| 2495 | -48 | -5648 | 15584 |
| 2496 | 144 | -5584 | 15216 |
| 2497 | 128 | -5792 | 15680 |
| 2498 | 160 | -5248 | 15472 |
| 2499 | 368 | -5456 | 15216 |
| 2500 | 80 | -5328 | 15088 |
| 2501 | 464 | -5584 | 15280 |
| 2502 | 160 | -5584 | 15472 |
| 2503 | 288 | -5792 | 15520 |
| 2504 | 368 | -5328 | 14992 |
| 2505 | -208 | -5824 | 15264 |
| 2506 | -288 | -5792 | 15216 |
| 2507 | 352 | -5904 | 16320 |
| 2508 | -480 | -5792 | 16320 |
| 2509 | 208 | -5728 | 15392 |
| 2510 | 160 | -5312 | 16336 |
| 2511 | 160 | -5856 | 15504 |
| 2512 | -96 | -5520 | 15472 |
| 2513 | 160 | -5824 | 15360 |
| 2514 | 160 | -5632 | 16384 |
| 2515 | 96 | -5328 | 14992 |
| 2516 | 160 | -5408 | 15280 |
| 2517 | 576 | -5792 | 15584 |
| 2518 | -192 | -5856 | 15488 |
| 2519 | 112 | -5728 | 15424 |
| 2520 | 256 | -5808 | 16320 |
| 2521 | 320 | -5488 | 15808 |
| 2522 | -144 | -5408 | 15344 |
| 2523 | -304 | -5712 | 15584 |
| 2524 | 352 | -5568 | 16320 |
| 2525 | 288 | -5856 | 15616 |
| 2526 | -240 | -6160 | 15280 |
| 2527 | 336 | -5520 | 15328 |
| 2528 | 192 | -5536 | 15280 |
| 2529 | 640 | -5984 | 15584 |
| 2530 | -240 | -5344 | 15216 |
| 2531 | -160 | -5360 | 14992 |
| 2532 | -304 | -5280 | 15808 |
| 2533 | -192 | -5344 | 15504 |
| 2534 | 352 | -5536 | 14896 |
| 2535 | 64 | -5824 | 15904 |
| 2536 | -464 | -5616 | 15216 |
| 2537 | 96 | -5392 | 14976 |
| 2538 | -160 | -5648 | 15744 |
| 2539 | -464 | -5920 | 14976 |
| 2540 | 112 | -5760 | 15056 |
| 2541 | -96 | -5568 | 15376 |
| 2542 | 96 | -5840 | 15424 |
| 2543 | -464 | -5792 | 15360 |
| 2544 | 208 | -5728 | 14848 |
| 2545 | 32 | -6096 | 15552 |
| 2546 | 256 | -5392 | 15744 |
| 2547 | 112 | -5520 | 15664 |
| 2548 | 160 | -5344 | 15600 |
| 2549 | 592 | -5392 | 15152 |
| 2550 | -96 | -5392 | 15808 |
| 2551 | 240 | -5312 | 15152 |
| 2552 | 112 | -5584 | 15552 |
| 2553 | 48 | -5312 | 14704 |
| 2554 | -304 | -5648 | 15600 |
| 2555 | 256 | -5584 | 15472 |
| 2556 | -304 | -5712 | 15216 |
| 2557 | -16 | -5760 | 15136 |
| 2558 | 320 | -5472 | 15664 |
| 2559 | -352 | -5920 | 15360 |
| 2560 | 288 | -5760 | 16384 |
| 2561 | 448 | -5680 | 15056 |
| 2562 | 176 | -5632 | 15296 |
| 2563 | -176 | -5600 | 14880 |
| 2564 | -336 | -5696 | 15376 |
| 2565 | -528 | -5584 | 15392 |
| 2566 | -224 | -5968 | 15424 |
| 2567 | 352 | -5904 | 15296 |
| 2568 | 160 | -5888 | 14752 |
| 2569 | 272 | -5968 | 15136 |
| 2570 | -272 | -5168 | 14832 |
| 2571 | 336 | -5712 | 15088 |
| 2572 | -80 | -5584 | 14896 |
| 2573 | 272 | -5792 | 15136 |
| 2574 | -64 | -5312 | 15600 |
| 2575 | 256 | -6096 | 15744 |
| 2576 | 512 | -5360 | 15696 |
| 2577 | 288 | -5552 | 16320 |
| 2578 | -224 | -5600 | 15600 |
| 2579 | 320 | -5456 | 15184 |
| 2580 | -32 | -5360 | 14992 |
| 2581 | -176 | -5488 | 15088 |
| 2582 | -160 | -5712 | 15808 |
| 2583 | -256 | -6096 | 15360 |
| 2584 | 160 | -5648 | 15152 |
| 2585 | -176 | -5632 | 15408 |
| 2586 | 80 | -5696 | 15488 |
| 2587 | -16 | -5584 | 15152 |
| 2588 | -272 | -5952 | 15328 |
| 2589 | -144 | -5744 | 14896 |
| 2590 | -48 | -5696 | 15232 |
| 2591 | 224 | -5328 | 14992 |
| 2592 | 176 | -5792 | 15712 |
| 2593 | 160 | -5616 | 15216 |
| 2594 | -240 | -5392 | 15824 |
| 2595 | -96 | -5584 | 15728 |
| 2596 | 272 | -5808 | 15136 |
| 2597 | -160 | -5360 | 15824 |
| 2598 | 352 | -5344 | 15440 |
| 2599 | 128 | -5760 | 15504 |
| 2600 | -464 | -5792 | 15104 |
| 2601 | 288 | -5648 | 15360 |
| 2602 | 304 | -5792 | 15744 |
| 2603 | 240 | -5312 | 14992 |
| 2604 | 256 | -5728 | 15264 |
| 2605 | -192 | -5568 | 15696 |
| 2606 | -48 | -5520 | 15616 |
| 2607 | 336 | -5824 | 16320 |
| 2608 | 384 | -5840 | 15504 |
| 2609 | 176 | -5424 | 15520 |
| 2610 | -496 | -5504 | 15744 |
| 2611 | -80 | -5616 | 14736 |
| 2612 | 416 | -5728 | 16320 |
| 2613 | 160 | -5568 | 15392 |
| 2614 | -144 | -5344 | 15088 |
| 2615 | -144 | -5760 | 14752 |
| 2616 | 336 | -5584 | 15152 |
| 2617 | 224 | -5504 | 14864 |
| 2618 | 400 | -5568 | 15696 |
| 2619 | -96 | -5296 | 15728 |
| 2620 | 368 | -5600 | 14768 |
| 2621 | -400 | -5632 | 14800 |
| 2622 | -224 | -5376 | 15184 |
| 2623 | -64 | -5808 | 15840 |
| 2624 | -176 | -5728 | 15360 |
| 2625 | 112 | -5376 | 14256 |
| 2626 | 368 | -5648 | 14256 |
| 2627 | 384 | -5648 | 15472 |
| 2628 | -160 | -5552 | 15136 |
| 2629 | -112 | -5552 | 15872 |
| 2630 | -32 | -5632 | 15152 |
| 2631 | -48 | -5696 | 15264 |
| 2632 | -272 | -5904 | 15136 |
| 2633 | 128 | -5632 | 15216 |
| 2634 | -16 | -5856 | 15296 |
| 2635 | 448 | -5968 | 15264 |
| 2636 | -192 | -5824 | 15648 |
| 2637 | 336 | -5392 | 15088 |
| 2638 | -240 | -5616 | 15184 |
| 2639 | 160 | -5968 | 15488 |
| 2640 | -224 | -5584 | 15680 |
| 2641 | -464 | -5328 | 15216 |
| 2642 | -464 | -5904 | 15520 |
| 2643 | 400 | -5808 | 15504 |
| 2644 | 160 | -5376 | 15424 |
| 2645 | -144 | -5824 | 15392 |
| 2646 | 448 | -5584 | 15760 |
| 2647 | 640 | -5840 | 15712 |
| 2648 | -64 | -5152 | 15824 |
| 2649 | 176 | -6160 | 14976 |
| 2650 | -192 | -5680 | 15808 |
| 2651 | -240 | -5440 | 15136 |
| 2652 | -160 | -5792 | 15024 |
| 2653 | 0 | -5968 | 15744 |
| 2654 | -144 | -5824 | 15248 |
| 2655 | -288 | -5664 | 16000 |
| 2656 | 32 | -5808 | 16352 |
| 2657 | -144 | -5360 | 15056 |
| 2658 | -96 | -5664 | 16320 |
| 2659 | 416 | -5904 | 15392 |
| 2660 | 320 | -5552 | 15984 |
| 2661 | 288 | -5760 | 14880 |
| 2662 | 288 | -5696 | 15280 |
| 2663 | 96 | -5200 | 16320 |
| 2664 | -272 | -5344 | 15808 |
| 2665 | -208 | -5552 | 15680 |
| 2666 | -80 | -5664 | 14896 |
| 2667 | -256 | -5440 | 15072 |
| 2668 | -48 | -5248 | 15216 |
| 2669 | 128 | -5904 | 15536 |
| 2670 | 176 | -5648 | 15296 |
| 2671 | 576 | -5792 | 15488 |
| 2672 | -176 | -5632 | 14960 |
| 2673 | 576 | -5824 | 15488 |
| 2674 | 288 | -5872 | 15296 |
| 2675 | -64 | -5408 | 15808 |
| 2676 | 592 | -5824 | 15584 |
| 2677 | -80 | -5376 | 15024 |
| 2678 | 256 | -5808 | 16352 |
| 2679 | -32 | -5360 | 14992 |
| 2680 | 288 | -5584 | 15568 |
| 2681 | 592 | -6048 | 14896 |
| 2682 | -64 | -5424 | 15440 |
| 2683 | 96 | -5376 | 15088 |
| 2684 | 16 | -5568 | 15216 |
| 2685 | 432 | -5584 | 15136 |
| 2686 | -464 | -5344 | 15600 |
| 2687 | -48 | -5408 | 15280 |
| 2688 | -304 | -5792 | 15696 |
| 2689 | 416 | -5600 | 15296 |
| 2690 | 208 | -5712 | 15808 |
| 2691 | -176 | -5680 | 14768 |
| 2692 | -464 | -5888 | 14976 |
| 2693 | -16 | -6000 | 15264 |
| 2694 | 192 | -5584 | 16080 |
| 2695 | 448 | -5584 | 15568 |
| 2696 | 208 | -5440 | 15440 |
| 2697 | 352 | -5584 | 15168 |
| 2698 | 208 | -5680 | 15408 |
| 2699 | 96 | -5888 | 15296 |
| 2700 | 288 | -5856 | 16320 |
| 2701 | 608 | -5600 | 15696 |
| 2702 | 144 | -5984 | 15360 |
| 2703 | -16 | -5632 | 14768 |
| 2704 | -80 | -5424 | 14256 |
| 2705 | -464 | -5392 | 15088 |
| 2706 | -48 | -5792 | 14896 |
| 2707 | 368 | -5232 | 15088 |
| 2708 | 384 | -5536 | 15856 |
| 2709 | -96 | -5696 | 15456 |
| 2710 | 160 | -5920 | 15744 |
| 2711 | -176 | -5424 | 15152 |
| 2712 | 160 | -5696 | 15360 |
| 2713 | -144 | -5280 | 15216 |
| 2714 | 240 | -5632 | 15104 |
| 2715 | 256 | -5584 | 16096 |
| 2716 | 240 | -5728 | 14848 |
| 2717 | 16 | -5824 | 15504 |
| 2718 | 256 | -5824 | 15296 |
| 2719 | 416 | -5392 | 14976 |
| 2720 | 320 | -6096 | 15104 |
| 2721 | -192 | -5552 | 15552 |
| 2722 | 176 | -5456 | 14864 |
| 2723 | -352 | -5248 | 15216 |
| 2724 | 272 | -5232 | 15440 |
| 2725 | -176 | -5408 | 15280 |
| 2726 | 192 | -5376 | 15856 |
| 2727 | -128 | -5392 | 15472 |
| 2728 | 576 | -5840 | 15360 |
| 2729 | 208 | -5728 | 15392 |
| 2730 | 128 | -5728 | 16064 |
| 2731 | 192 | -5840 | 15808 |
| 2732 | 432 | -5504 | 14880 |
| 2733 | -96 | -5136 | 15600 |
| 2734 | 272 | -5808 | 15248 |
| 2735 | 176 | -5392 | 15600 |
| 2736 | 192 | -5664 | 15696 |
| 2737 | -272 | -5296 | 15056 |
| 2738 | 368 | -5408 | 15312 |
| 2739 | 208 | -5808 | 15104 |
| 2740 | 80 | -5840 | 15264 |
| 2741 | -176 | -5776 | 15376 |
| 2742 | -144 | -6016 | 15232 |
| 2743 | 128 | -6096 | 15408 |
| 2744 | -464 | -5328 | 15088 |
| 2745 | 640 | -5536 | 16320 |
| 2746 | -112 | -5600 | 15808 |
| 2747 | 288 | -5280 | 15536 |
| 2748 | 336 | -5872 | 15680 |
| 2749 | 128 | -5360 | 15856 |
| 2750 | -32 | -5360 | 16320 |
| 2751 | -16 | -5408 | 14896 |
| 2752 | 288 | -5920 | 15360 |
| 2753 | 384 | -5840 | 15680 |
| 2754 | 160 | -5664 | 15744 |
| 2755 | 400 | -5664 | 15232 |
| 2756 | 144 | -5344 | 15600 |
| 2757 | 288 | -5936 | 15424 |
| 2758 | -176 | -5696 | 15648 |
| 2759 | -464 | -5792 | 15744 |
| 2760 | 160 | -5808 | 15744 |
| 2761 | 192 | -5664 | 15760 |
| 2762 | 112 | -6032 | 15360 |
| 2763 | 176 | -5760 | 15136 |
| 2764 | -224 | -5792 | 15488 |
| 2765 | 288 | -5376 | 15856 |
| 2766 | -144 | -5312 | 15088 |
| 2767 | 48 | -5536 | 15136 |
| 2768 | -272 | -5488 | 14896 |
| 2769 | 240 | -5408 | 15088 |
| 2770 | 160 | -5968 | 16384 |
| 2771 | -96 | -5840 | 15504 |
| 2772 | -464 | -5392 | 15136 |
| 2773 | 192 | -5552 | 15696 |
| 2774 | 256 | -5824 | 15808 |
| 2775 | 0 | -5376 | 15584 |
| 2776 | -80 | -5680 | 15360 |
| 2777 | -16 | -6016 | 15056 |
| 2778 | 128 | -5904 | 15392 |
| 2779 | 112 | -5344 | 15056 |
| 2780 | 176 | -5776 | 15488 |
| 2781 | 400 | -5568 | 15248 |
| 2782 | 288 | -5904 | 15696 |
| 2783 | -80 | -5856 | 14976 |
| 2784 | 208 | -5488 | 15136 |
| 2785 | 384 | -5824 | 15504 |
| 2786 | -400 | -5824 | 14976 |
| 2787 | -208 | -5712 | 15808 |
| 2788 | 368 | -5824 | 15072 |
| 2789 | -336 | -5792 | 15360 |
| 2790 | 240 | -5632 | 15008 |
| 2791 | 208 | -5824 | 15584 |
| 2792 | 208 | -5664 | 15136 |
| 2793 | 176 | -5616 | 15152 |
| 2794 | -16 | -5264 | 14896 |
| 2795 | 128 | -5376 | 15248 |
| 2796 | 192 | -5744 | 15504 |
| 2797 | -272 | -5968 | 15360 |
| 2798 | 304 | -5840 | 15520 |
| 2799 | 176 | -5568 | 15040 |
| 2800 | -64 | -5568 | 15472 |
| 2801 | -144 | -5408 | 15088 |
| 2802 | 208 | -5600 | 15248 |
| 2803 | 480 | -5424 | 16320 |
| 2804 | 320 | -6000 | 15360 |
| 2805 | 336 | -5584 | 15216 |
| 2806 | 16 | -5824 | 15136 |
| 2807 | 160 | -5632 | 15696 |
| 2808 | -16 | -5376 | 15056 |
| 2809 | -160 | -5856 | 16320 |
| 2810 | -48 | -5440 | 15936 |
| 2811 | -176 | -5952 | 15360 |
| 2812 | -352 | -6096 | 15392 |
| 2813 | 352 | -5344 | 14992 |
| 2814 | 288 | -5616 | 15520 |
| 2815 | -464 | -5776 | 15488 |
| 2816 | -160 | -5600 | 14832 |
| 2817 | -464 | -5584 | 15248 |
| 2818 | -256 | -5440 | 16320 |
| 2819 | 288 | -5936 | 15440 |
| 2820 | 0 | -5424 | 15680 |
| 2821 | 416 | -5312 | 15520 |
| 2822 | -96 | -5360 | 15824 |
| 2823 | 240 | -5808 | 15296 |
| 2824 | 176 | -5392 | 14896 |
| 2825 | -160 | -6000 | 15424 |
| 2826 | -176 | -5936 | 15360 |
| 2827 | -144 | -5744 | 15360 |
| 2828 | 528 | -5776 | 15584 |
| 2829 | -224 | -5792 | 15424 |
| 2830 | 80 | -5792 | 15584 |
| 2831 | 256 | -5504 | 15696 |
| 2832 | -64 | -5792 | 15392 |
| 2833 | -48 | -5248 | 15184 |
| 2834 | 80 | -5920 | 16000 |
| 2835 | 320 | -5552 | 15424 |
| 2836 | 288 | -5408 | 15232 |
| 2837 | -144 | -5568 | 15664 |
| 2838 | 176 | -5456 | 16320 |
| 2839 | -48 | -5792 | 15712 |
| 2840 | -128 | -5392 | 15216 |
| 2841 | 320 | -5648 | 15456 |
| 2842 | -208 | -5408 | 15184 |
| 2843 | 160 | -5712 | 15568 |
| 2844 | -208 | -5808 | 14928 |
| 2845 | -176 | -5840 | 15056 |
| 2846 | 256 | -5744 | 15488 |
| 2847 | 272 | -5968 | 15136 |
| 2848 | 176 | -5616 | 15488 |
| 2849 | 256 | -5616 | 15504 |
| 2850 | -48 | -5520 | 15280 |
| 2851 | -144 | -5584 | 14896 |
| 2852 | 288 | -5456 | 15536 |
| 2853 | 256 | -6048 | 15392 |
| 2854 | 160 | -5456 | 14832 |
| 2855 | 240 | -5632 | 15008 |
| 2856 | -192 | -5744 | 15712 |
| 2857 | 272 | -5296 | 15696 |
| 2858 | 272 | -5680 | 15440 |
| 2859 | -112 | -5904 | 15312 |
| 2860 | -480 | -5776 | 15440 |
| 2861 | 160 | -5472 | 15472 |
| 2862 | 352 | -5520 | 15744 |
| 2863 | 208 | -5648 | 15584 |
| 2864 | -176 | -5968 | 15360 |
| 2865 | -176 | -5696 | 15136 |
| 2866 | -144 | -5712 | 15296 |
| 2867 | 336 | -5312 | 15088 |
| 2868 | 272 | -6048 | 15552 |
| 2869 | -80 | -5440 | 15088 |
| 2870 | 128 | -5808 | 15504 |
| 2871 | -32 | -5872 | 15296 |
| 2872 | 48 | -5424 | 15088 |
| 2873 | -16 | -5440 | 15136 |
| 2874 | 256 | -5792 | 15488 |
| 2875 | 304 | -5792 | 14896 |
| 2876 | -224 | -5840 | 15456 |
| 2877 | -384 | -5216 | 15728 |
| 2878 | 96 | -5904 | 15488 |
| 2879 | -208 | -5680 | 15264 |
| 2880 | 208 | -5824 | 15296 |
| 2881 | 112 | -5680 | 15088 |
| 2882 | -64 | -5488 | 15696 |
| 2883 | 256 | -5920 | 15280 |
| 2884 | 16 | -5600 | 15312 |
| 2885 | -64 | -5584 | 15280 |
| 2886 | 288 | -5760 | 15280 |
| 2887 | 384 | -5168 | 15728 |
| 2888 | 384 | -6064 | 15280 |
| 2889 | 432 | -5952 | 15488 |
| 2890 | -48 | -5312 | 15152 |
| 2891 | 256 | -5488 | 15856 |
| 2892 | -176 | -5728 | 15088 |
| 2893 | 208 | -5952 | 14768 |
| 2894 | -16 | -5488 | 15568 |
| 2895 | 256 | -5328 | 15728 |
| 2896 | -16 | -5632 | 15440 |
| 2897 | -496 | -5744 | 14928 |
| 2898 | 336 | -5392 | 15280 |
| 2899 | -272 | -5408 | 15680 |
| 2900 | -192 | -5920 | 15280 |
| 2901 | -176 | -5472 | 15376 |
| 2902 | 288 | -5952 | 14880 |
| 2903 | -352 | -5568 | 15440 |
| 2904 | -224 | -5312 | 15216 |
| 2905 | -144 | -5312 | 15088 |
| 2906 | -80 | -5440 | 15376 |
| 2907 | 368 | -5760 | 15360 |
| 2908 | 272 | -5472 | 15696 |
| 2909 | -176 | -5760 | 15168 |
| 2910 | 352 | -5696 | 16000 |
| 2911 | 336 | -5488 | 15440 |
| 2912 | -64 | -5664 | 15280 |
| 2913 | 176 | -5440 | 15360 |
| 2914 | 288 | -5632 | 15328 |
| 2915 | -480 | -5360 | 15024 |
| 2916 | 416 | -5840 | 15680 |
| 2917 | -64 | -5344 | 15168 |
| 2918 | 224 | -5616 | 15440 |
| 2919 | -16 | -5600 | 15552 |
| 2920 | 192 | -5616 | 15216 |
| 2921 | 400 | -5792 | 15584 |
| 2922 | -288 | -5360 | 14992 |
| 2923 | 192 | -5360 | 14992 |
| 2924 | 576 | -5760 | 15360 |
| 2925 | 272 | -5600 | 15584 |
| 2926 | 304 | -5760 | 15104 |
| 2927 | 112 | -5664 | 15360 |
| 2928 | 256 | -5488 | 15504 |
| 2929 | 352 | -5856 | 15008 |
| 2930 | -144 | -5776 | 14864 |
| 2931 | 272 | -5440 | 15280 |
| 2932 | 0 | -5632 | 15568 |
| 2933 | -144 | -5696 | 15296 |
| 2934 | -16 | -5376 | 14864 |
| 2935 | 0 | -5824 | 15136 |
| 2936 | 352 | -5952 | 14880 |
| 2937 | -144 | -5600 | 15104 |
| 2938 | 304 | -5584 | 15312 |
| 2939 | 256 | -5392 | 16096 |
| 2940 | 336 | -5392 | 15216 |
| 2941 | 208 | -5728 | 15104 |
| 2942 | 208 | -5488 | 15104 |
| 2943 | -272 | -5184 | 15088 |
| 2944 | 208 | -5824 | 15136 |
| 2945 | 160 | -5824 | 15488 |
| 2946 | -144 | -5888 | 15136 |
| 2947 | 400 | -5920 | 15840 |
| 2948 | -32 | -5360 | 15552 |
| 2949 | 208 | -5760 | 15248 |
| 2950 | -208 | -5792 | 15360 |
| 2951 | 208 | -5792 | 15584 |
| 2952 | -208 | -5280 | 14992 |
| 2953 | 112 | -5632 | 14848 |
| 2954 | 432 | -5600 | 15296 |
| 2955 | -16 | -5408 | 15184 |
| 2956 | -208 | -5776 | 15296 |
| 2957 | -160 | -5392 | 15440 |
| 2958 | 256 | -5440 | 15280 |
| 2959 | 384 | -5568 | 15968 |
| 2960 | 336 | -5648 | 15168 |
| 2961 | 352 | -5872 | 15360 |
| 2962 | -176 | -5328 | 15312 |
| 2963 | -64 | -5696 | 15488 |
| 2964 | 304 | -5904 | 15360 |
| 2965 | 288 | -5376 | 15280 |
| 2966 | 272 | -5600 | 15488 |
| 2967 | -64 | -5328 | 15280 |
| 2968 | -224 | -5824 | 15488 |
| 2969 | -176 | -5840 | 15360 |
| 2970 | 160 | -5776 | 15376 |
| 2971 | 368 | -6224 | 15296 |
| 2972 | 304 | -5488 | 14704 |
| 2973 | 320 | -5744 | 14768 |
| 2974 | -112 | -5696 | 15808 |
| 2975 | 128 | -5712 | 15696 |
| 2976 | 352 | -5440 | 15696 |
| 2977 | 32 | -6016 | 15296 |
| 2978 | -304 | -5408 | 15152 |
| 2979 | -32 | -5360 | 14992 |
| 2980 | 64 | -6048 | 15744 |
| 2981 | 192 | -5712 | 15408 |
| 2982 | 208 | -5504 | 15104 |
| 2983 | -144 | -5312 | 15088 |
| 2984 | 352 | -6048 | 14768 |
| 2985 | 384 | -5696 | 15712 |
| 2986 | -16 | -5280 | 14832 |
| 2987 | 240 | -6000 | 15072 |